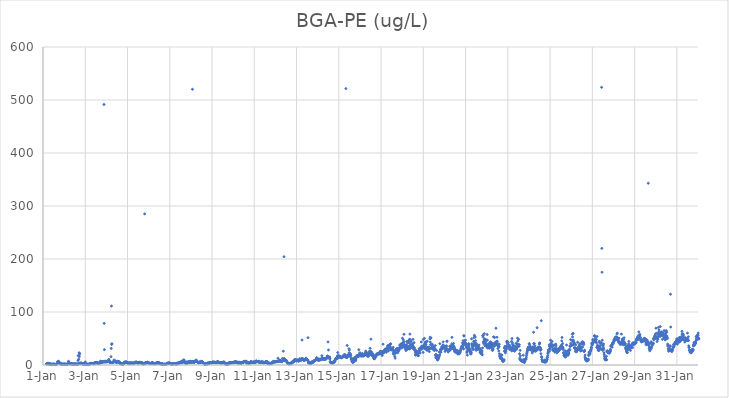
| Category | BGA-PE (ug/L) |
|---|---|
| 44562.166666666664 | 2.11 |
| 44562.177083333336 | 2.29 |
| 44562.1875 | 2.16 |
| 44562.197916666664 | 2.28 |
| 44562.208333333336 | 2.72 |
| 44562.21875 | 2.6 |
| 44562.229166666664 | 2.61 |
| 44562.239583333336 | 3.58 |
| 44562.25 | 2.67 |
| 44562.260416666664 | 2.59 |
| 44562.270833333336 | 2.35 |
| 44562.28125 | 1.76 |
| 44562.291666666664 | 1.93 |
| 44562.302083333336 | 1.72 |
| 44562.3125 | 1.82 |
| 44562.322916666664 | 1.83 |
| 44562.333333333336 | 1.77 |
| 44562.34375 | 2.21 |
| 44562.354166666664 | 1.28 |
| 44562.364583333336 | 1.04 |
| 44562.375 | 1.1 |
| 44562.385416666664 | 1.13 |
| 44562.395833333336 | 1.22 |
| 44562.40625 | 1.35 |
| 44562.416666666664 | 1.41 |
| 44562.427083333336 | 1.31 |
| 44562.4375 | 1.49 |
| 44562.447916666664 | 1.39 |
| 44562.458333333336 | 1.37 |
| 44562.46875 | 1.11 |
| 44562.479166666664 | 1.29 |
| 44562.489583333336 | 1.22 |
| 44562.5 | 1.03 |
| 44562.510416666664 | 1.6 |
| 44562.520833333336 | 1.67 |
| 44562.53125 | 1.59 |
| 44562.541666666664 | 1.43 |
| 44562.552083333336 | 1.12 |
| 44562.5625 | 1.05 |
| 44562.572916666664 | 0.8 |
| 44562.583333333336 | 1.04 |
| 44562.59375 | 0.9 |
| 44562.604166666664 | 0.95 |
| 44562.614583333336 | 0.87 |
| 44562.625 | 1.25 |
| 44562.635416666664 | 1.16 |
| 44562.645833333336 | 1.5 |
| 44562.65625 | 1.87 |
| 44562.666666666664 | 2.55 |
| 44562.677083333336 | 2.93 |
| 44562.6875 | 5.84 |
| 44562.697916666664 | 5.86 |
| 44562.708333333336 | 6.3 |
| 44562.71875 | 5.9 |
| 44562.729166666664 | 4.77 |
| 44562.739583333336 | 7.11 |
| 44562.75 | 4.66 |
| 44562.760416666664 | 4.44 |
| 44562.770833333336 | 3.27 |
| 44562.78125 | 4.49 |
| 44562.791666666664 | 3.69 |
| 44562.802083333336 | 3.65 |
| 44562.8125 | 2.8 |
| 44562.822916666664 | 2.25 |
| 44562.833333333336 | 2.29 |
| 44562.84375 | 2.47 |
| 44562.854166666664 | 2.15 |
| 44562.864583333336 | 2.07 |
| 44562.875 | 1.8 |
| 44562.885416666664 | 1.58 |
| 44562.895833333336 | 1.56 |
| 44562.90625 | 1.45 |
| 44562.916666666664 | 1.4 |
| 44562.927083333336 | 1.37 |
| 44562.9375 | 1.07 |
| 44562.947916666664 | 1.41 |
| 44562.958333333336 | 1.6 |
| 44562.96875 | 1.5 |
| 44562.979166666664 | 1.43 |
| 44562.989583333336 | 1.56 |
| 44563.0 | 1.49 |
| 44563.010416666664 | 1.58 |
| 44563.020833333336 | 1.63 |
| 44563.03125 | 2.08 |
| 44563.041666666664 | 1.45 |
| 44563.052083333336 | 1.15 |
| 44563.0625 | 1.32 |
| 44563.072916666664 | 1.17 |
| 44563.083333333336 | 1.31 |
| 44563.09375 | 1.29 |
| 44563.104166666664 | 1.23 |
| 44563.114583333336 | 1.16 |
| 44563.125 | 1.4 |
| 44563.135416666664 | 1.49 |
| 44563.145833333336 | 1.49 |
| 44563.15625 | 1.48 |
| 44563.166666666664 | 1.78 |
| 44563.177083333336 | 2.18 |
| 44563.1875 | 2.07 |
| 44563.197916666664 | 2.63 |
| 44563.208333333336 | 7.02 |
| 44563.21875 | 3.96 |
| 44563.229166666664 | 4.79 |
| 44563.239583333336 | 3.09 |
| 44563.25 | 2.77 |
| 44563.260416666664 | 2.47 |
| 44563.270833333336 | 2.76 |
| 44563.28125 | 2.58 |
| 44563.291666666664 | 2.22 |
| 44563.302083333336 | 2.59 |
| 44563.3125 | 2.33 |
| 44563.322916666664 | 2.36 |
| 44563.333333333336 | 2.18 |
| 44563.34375 | 2.45 |
| 44563.354166666664 | 1.99 |
| 44563.364583333336 | 1.74 |
| 44563.375 | 2.13 |
| 44563.385416666664 | 1.73 |
| 44563.395833333336 | 1.85 |
| 44563.40625 | 1.39 |
| 44563.416666666664 | 1.36 |
| 44563.427083333336 | 1.41 |
| 44563.4375 | 1.69 |
| 44563.447916666664 | 1.9 |
| 44563.458333333336 | 1.41 |
| 44563.46875 | 1.87 |
| 44563.479166666664 | 1.91 |
| 44563.489583333336 | 1.46 |
| 44563.5 | 1.68 |
| 44563.510416666664 | 1.66 |
| 44563.520833333336 | 1.47 |
| 44563.53125 | 1.86 |
| 44563.541666666664 | 1.67 |
| 44563.552083333336 | 1.77 |
| 44563.5625 | 1.71 |
| 44563.572916666664 | 1.68 |
| 44563.583333333336 | 1.6 |
| 44563.59375 | 1.88 |
| 44563.604166666664 | 1.62 |
| 44563.614583333336 | 1.55 |
| 44563.625 | 1.27 |
| 44563.635416666664 | 1.2 |
| 44563.645833333336 | 1.07 |
| 44563.65625 | 8.64 |
| 44563.666666666664 | 17.61 |
| 44563.677083333336 | 2.74 |
| 44563.6875 | 10.89 |
| 44563.697916666664 | 17.62 |
| 44563.708333333336 | 23.09 |
| 44563.71875 | 15.84 |
| 44563.729166666664 | 3.03 |
| 44563.739583333336 | 21.26 |
| 44563.75 | 3.67 |
| 44563.760416666664 | 3.06 |
| 44563.770833333336 | 2.98 |
| 44563.78125 | 3.27 |
| 44563.791666666664 | 2.96 |
| 44563.802083333336 | 2.76 |
| 44563.8125 | 3.29 |
| 44563.822916666664 | 3.71 |
| 44563.833333333336 | 3.31 |
| 44563.84375 | 2.88 |
| 44563.854166666664 | 2.68 |
| 44563.864583333336 | 2.38 |
| 44563.875 | 2.27 |
| 44563.885416666664 | 2.09 |
| 44563.895833333336 | 1.88 |
| 44563.90625 | 2.05 |
| 44563.916666666664 | 1.8 |
| 44563.927083333336 | 1.5 |
| 44563.9375 | 1.96 |
| 44563.947916666664 | 1.76 |
| 44563.958333333336 | 1.69 |
| 44563.96875 | 1.4 |
| 44563.979166666664 | 1.38 |
| 44563.989583333336 | 1.44 |
| 44564.0 | 5.81 |
| 44564.010416666664 | 1.47 |
| 44564.020833333336 | 1.43 |
| 44564.03125 | 1.42 |
| 44564.041666666664 | 1.51 |
| 44564.052083333336 | 1.83 |
| 44564.0625 | 2.11 |
| 44564.072916666664 | 1.36 |
| 44564.083333333336 | 1.62 |
| 44564.09375 | 1.32 |
| 44564.104166666664 | 1.28 |
| 44564.114583333336 | 1.21 |
| 44564.125 | 1.11 |
| 44564.135416666664 | 1.21 |
| 44564.145833333336 | 0.77 |
| 44564.15625 | 1.3 |
| 44564.166666666664 | 1.34 |
| 44564.177083333336 | 1.59 |
| 44564.1875 | 1.84 |
| 44564.197916666664 | 1.63 |
| 44564.208333333336 | 1.71 |
| 44564.21875 | 1.95 |
| 44564.229166666664 | 1.95 |
| 44564.239583333336 | 2.79 |
| 44564.25 | 2.95 |
| 44564.260416666664 | 3.01 |
| 44564.270833333336 | 3.1 |
| 44564.28125 | 2.88 |
| 44564.291666666664 | 2.84 |
| 44564.302083333336 | 2.92 |
| 44564.3125 | 2.6 |
| 44564.322916666664 | 2.63 |
| 44564.333333333336 | 2.81 |
| 44564.34375 | 2.92 |
| 44564.354166666664 | 2.99 |
| 44564.364583333336 | 2.77 |
| 44564.375 | 2.36 |
| 44564.385416666664 | 2.58 |
| 44564.395833333336 | 2.36 |
| 44564.40625 | 2.83 |
| 44564.416666666664 | 3.6 |
| 44564.427083333336 | 3.72 |
| 44564.4375 | 3.24 |
| 44564.447916666664 | 3.56 |
| 44564.458333333336 | 4.27 |
| 44564.46875 | 4.19 |
| 44564.479166666664 | 3.88 |
| 44564.489583333336 | 4.15 |
| 44564.5 | 4.04 |
| 44564.510416666664 | 3.62 |
| 44564.520833333336 | 4.27 |
| 44564.53125 | 4.92 |
| 44564.541666666664 | 4.33 |
| 44564.552083333336 | 4.77 |
| 44564.5625 | 4.04 |
| 44564.572916666664 | 4.05 |
| 44564.583333333336 | 3.89 |
| 44564.59375 | 3.47 |
| 44564.604166666664 | 3.73 |
| 44564.614583333336 | 3.18 |
| 44564.625 | 3.14 |
| 44564.635416666664 | 3.45 |
| 44564.645833333336 | 3.09 |
| 44564.65625 | 3.25 |
| 44564.666666666664 | 3.55 |
| 44564.677083333336 | 2.81 |
| 44564.6875 | 3.96 |
| 44564.697916666664 | 4.67 |
| 44564.708333333336 | 4.89 |
| 44564.71875 | 7.16 |
| 44564.729166666664 | 5.32 |
| 44564.739583333336 | 6.96 |
| 44564.75 | 5.05 |
| 44564.760416666664 | 5.24 |
| 44564.770833333336 | 5.33 |
| 44564.78125 | 5.11 |
| 44564.791666666664 | 5.12 |
| 44564.802083333336 | 4.48 |
| 44564.8125 | 5.64 |
| 44564.822916666664 | 5.12 |
| 44564.833333333336 | 6.38 |
| 44564.84375 | 6.57 |
| 44564.854166666664 | 6.22 |
| 44564.864583333336 | 6.23 |
| 44564.875 | 6.64 |
| 44564.885416666664 | 491.51 |
| 44564.895833333336 | 78.56 |
| 44564.90625 | 28.94 |
| 44564.916666666664 | 6.84 |
| 44564.927083333336 | 5.44 |
| 44564.9375 | 5.77 |
| 44564.947916666664 | 6.09 |
| 44564.958333333336 | 6.43 |
| 44564.96875 | 7.43 |
| 44564.979166666664 | 6.88 |
| 44564.989583333336 | 6.23 |
| 44565.0 | 6.31 |
| 44565.010416666664 | 6.39 |
| 44565.020833333336 | 6.7 |
| 44565.03125 | 6.05 |
| 44565.041666666664 | 6.24 |
| 44565.052083333336 | 6.72 |
| 44565.0625 | 6.73 |
| 44565.072916666664 | 6.51 |
| 44565.083333333336 | 7.16 |
| 44565.09375 | 7.15 |
| 44565.104166666664 | 8.91 |
| 44565.114583333336 | 10.65 |
| 44565.125 | 8.88 |
| 44565.135416666664 | 5.87 |
| 44565.145833333336 | 5.55 |
| 44565.15625 | 5.3 |
| 44565.166666666664 | 5.95 |
| 44565.177083333336 | 5.73 |
| 44565.1875 | 5.72 |
| 44565.197916666664 | 4.88 |
| 44565.208333333336 | 4.74 |
| 44565.21875 | 15.75 |
| 44565.229166666664 | 31.36 |
| 44565.239583333336 | 111.18 |
| 44565.25 | 38.77 |
| 44565.260416666664 | 40.15 |
| 44565.270833333336 | 4.97 |
| 44565.28125 | 5.16 |
| 44565.291666666664 | 4.92 |
| 44565.302083333336 | 4.88 |
| 44565.3125 | 5.42 |
| 44565.322916666664 | 5.68 |
| 44565.333333333336 | 6.02 |
| 44565.34375 | 5.96 |
| 44565.354166666664 | 5.97 |
| 44565.364583333336 | 9.51 |
| 44565.375 | 6.16 |
| 44565.385416666664 | 6.62 |
| 44565.395833333336 | 6.42 |
| 44565.40625 | 7.73 |
| 44565.416666666664 | 7.34 |
| 44565.427083333336 | 6.47 |
| 44565.4375 | 5.86 |
| 44565.447916666664 | 5.47 |
| 44565.458333333336 | 6.28 |
| 44565.46875 | 5.39 |
| 44565.479166666664 | 5.01 |
| 44565.489583333336 | 5.59 |
| 44565.5 | 4.86 |
| 44565.510416666664 | 5.76 |
| 44565.520833333336 | 5.95 |
| 44565.53125 | 6.95 |
| 44565.541666666664 | 7.04 |
| 44565.552083333336 | 6.57 |
| 44565.5625 | 6.72 |
| 44565.572916666664 | 6.26 |
| 44565.583333333336 | 5.77 |
| 44565.59375 | 5.93 |
| 44565.604166666664 | 6.02 |
| 44565.614583333336 | 5.01 |
| 44565.625 | 4.26 |
| 44565.635416666664 | 4.15 |
| 44565.645833333336 | 4.17 |
| 44565.65625 | 2.58 |
| 44565.666666666664 | 2.38 |
| 44565.677083333336 | 2.98 |
| 44565.6875 | 2.54 |
| 44565.697916666664 | 2.81 |
| 44565.708333333336 | 2.32 |
| 44565.71875 | 2.28 |
| 44565.729166666664 | 1.75 |
| 44565.739583333336 | 1.94 |
| 44565.75 | 1.74 |
| 44565.760416666664 | 1.83 |
| 44565.770833333336 | 1.88 |
| 44565.78125 | 2.08 |
| 44565.791666666664 | 1.95 |
| 44565.802083333336 | 1.94 |
| 44565.8125 | 2.76 |
| 44565.822916666664 | 2.54 |
| 44565.833333333336 | 3.47 |
| 44565.84375 | 4.47 |
| 44565.854166666664 | 4.86 |
| 44565.864583333336 | 5.23 |
| 44565.875 | 5.36 |
| 44565.885416666664 | 5.89 |
| 44565.895833333336 | 4.97 |
| 44565.90625 | 5.16 |
| 44565.916666666664 | 4.94 |
| 44565.927083333336 | 5.15 |
| 44565.9375 | 5.59 |
| 44565.947916666664 | 5.92 |
| 44565.958333333336 | 4.86 |
| 44565.96875 | 4.89 |
| 44565.979166666664 | 4.81 |
| 44565.989583333336 | 4.31 |
| 44566.0 | 3.94 |
| 44566.010416666664 | 3.83 |
| 44566.020833333336 | 3.91 |
| 44566.03125 | 3.57 |
| 44566.041666666664 | 3.56 |
| 44566.052083333336 | 3.29 |
| 44566.0625 | 3.26 |
| 44566.072916666664 | 3.29 |
| 44566.083333333336 | 3.52 |
| 44566.09375 | 3.62 |
| 44566.104166666664 | 3.82 |
| 44566.114583333336 | 3.82 |
| 44566.125 | 3.66 |
| 44566.135416666664 | 4.11 |
| 44566.145833333336 | 4.14 |
| 44566.15625 | 4.55 |
| 44566.166666666664 | 3.72 |
| 44566.177083333336 | 3.39 |
| 44566.1875 | 3.18 |
| 44566.197916666664 | 2.96 |
| 44566.208333333336 | 3.07 |
| 44566.21875 | 4.18 |
| 44566.229166666664 | 3.01 |
| 44566.239583333336 | 3.11 |
| 44566.25 | 2.92 |
| 44566.260416666664 | 2.66 |
| 44566.270833333336 | 2.74 |
| 44566.28125 | 2.9 |
| 44566.291666666664 | 3.3 |
| 44566.302083333336 | 4.05 |
| 44566.3125 | 4.14 |
| 44566.322916666664 | 3.85 |
| 44566.333333333336 | 4.39 |
| 44566.34375 | 4.23 |
| 44566.354166666664 | 4.23 |
| 44566.364583333336 | 4.4 |
| 44566.375 | 4.91 |
| 44566.385416666664 | 5.58 |
| 44566.395833333336 | 4.71 |
| 44566.40625 | 5.23 |
| 44566.416666666664 | 5.71 |
| 44566.427083333336 | 4.61 |
| 44566.4375 | 4.72 |
| 44566.447916666664 | 4.4 |
| 44566.458333333336 | 4.78 |
| 44566.46875 | 4.73 |
| 44566.479166666664 | 3.98 |
| 44566.489583333336 | 3.98 |
| 44566.5 | 4.04 |
| 44566.510416666664 | 3.81 |
| 44566.520833333336 | 3.92 |
| 44566.53125 | 3.81 |
| 44566.541666666664 | 3.99 |
| 44566.552083333336 | 4.38 |
| 44566.5625 | 4.97 |
| 44566.572916666664 | 4.76 |
| 44566.583333333336 | 4.6 |
| 44566.59375 | 5.1 |
| 44566.604166666664 | 4.72 |
| 44566.614583333336 | 4.89 |
| 44566.625 | 4.7 |
| 44566.635416666664 | 3.94 |
| 44566.645833333336 | 3.26 |
| 44566.65625 | 3.48 |
| 44566.666666666664 | 4.47 |
| 44566.677083333336 | 4.49 |
| 44566.6875 | 4.29 |
| 44566.697916666664 | 3.27 |
| 44566.708333333336 | 2.87 |
| 44566.71875 | 2.17 |
| 44566.729166666664 | 3.49 |
| 44566.739583333336 | 3.12 |
| 44566.75 | 2.86 |
| 44566.760416666664 | 2.6 |
| 44566.770833333336 | 1.72 |
| 44566.78125 | 2.61 |
| 44566.791666666664 | 2.53 |
| 44566.802083333336 | 2.63 |
| 44566.8125 | 285.13 |
| 44566.822916666664 | 3.67 |
| 44566.833333333336 | 3.15 |
| 44566.84375 | 4.15 |
| 44566.854166666664 | 4.37 |
| 44566.864583333336 | 4.66 |
| 44566.875 | 4.27 |
| 44566.885416666664 | 4.46 |
| 44566.895833333336 | 4.27 |
| 44566.90625 | 4.06 |
| 44566.916666666664 | 4.03 |
| 44566.927083333336 | 5.26 |
| 44566.9375 | 4.32 |
| 44566.947916666664 | 5.22 |
| 44566.958333333336 | 4.73 |
| 44566.96875 | 4.41 |
| 44566.979166666664 | 4.07 |
| 44566.989583333336 | 4.1 |
| 44567.0 | 3.97 |
| 44567.010416666664 | 3.7 |
| 44567.020833333336 | 3.49 |
| 44567.03125 | 3.88 |
| 44567.041666666664 | 3.08 |
| 44567.052083333336 | 2.7 |
| 44567.0625 | 3.13 |
| 44567.072916666664 | 2.64 |
| 44567.083333333336 | 2.91 |
| 44567.09375 | 2.89 |
| 44567.104166666664 | 2.64 |
| 44567.114583333336 | 3.33 |
| 44567.125 | 3.05 |
| 44567.135416666664 | 2.96 |
| 44567.145833333336 | 3.44 |
| 44567.15625 | 3.65 |
| 44567.166666666664 | 4.77 |
| 44567.177083333336 | 4.05 |
| 44567.1875 | 3.9 |
| 44567.197916666664 | 4.57 |
| 44567.208333333336 | 2.63 |
| 44567.21875 | 2.44 |
| 44567.229166666664 | 2.6 |
| 44567.239583333336 | 2.7 |
| 44567.25 | 2.59 |
| 44567.260416666664 | 2.6 |
| 44567.270833333336 | 2.74 |
| 44567.28125 | 2.3 |
| 44567.291666666664 | 2.28 |
| 44567.302083333336 | 2.63 |
| 44567.3125 | 2.71 |
| 44567.322916666664 | 3.09 |
| 44567.333333333336 | 2.79 |
| 44567.34375 | 3.35 |
| 44567.354166666664 | 3.4 |
| 44567.364583333336 | 3.49 |
| 44567.375 | 3.71 |
| 44567.385416666664 | 3.47 |
| 44567.395833333336 | 3.89 |
| 44567.40625 | 4.15 |
| 44567.416666666664 | 3.67 |
| 44567.427083333336 | 4.73 |
| 44567.4375 | 4.31 |
| 44567.447916666664 | 4.08 |
| 44567.458333333336 | 3.75 |
| 44567.46875 | 3.77 |
| 44567.479166666664 | 3.75 |
| 44567.489583333336 | 3.4 |
| 44567.5 | 3.94 |
| 44567.510416666664 | 3.69 |
| 44567.520833333336 | 3.34 |
| 44567.53125 | 3.56 |
| 44567.541666666664 | 3.08 |
| 44567.552083333336 | 2.54 |
| 44567.5625 | 2.37 |
| 44567.572916666664 | 2.17 |
| 44567.583333333336 | 2.22 |
| 44567.59375 | 2.31 |
| 44567.604166666664 | 1.94 |
| 44567.614583333336 | 2.05 |
| 44567.625 | 2.56 |
| 44567.635416666664 | 2.59 |
| 44567.645833333336 | 2.04 |
| 44567.65625 | 1.23 |
| 44567.666666666664 | 0.93 |
| 44567.677083333336 | 1.3 |
| 44567.6875 | 1.24 |
| 44567.697916666664 | 1.38 |
| 44567.708333333336 | 1.08 |
| 44567.71875 | 1.06 |
| 44567.729166666664 | 1.39 |
| 44567.739583333336 | 0.95 |
| 44567.75 | 1.34 |
| 44567.760416666664 | 1.46 |
| 44567.770833333336 | 1.47 |
| 44567.78125 | 1.3 |
| 44567.791666666664 | 1.26 |
| 44567.802083333336 | 0.83 |
| 44567.8125 | 1.22 |
| 44567.822916666664 | 1.59 |
| 44567.833333333336 | 1.16 |
| 44567.84375 | 1.82 |
| 44567.854166666664 | 1.87 |
| 44567.864583333336 | 2.66 |
| 44567.875 | 3.16 |
| 44567.885416666664 | 3.35 |
| 44567.895833333336 | 2.85 |
| 44567.90625 | 3.34 |
| 44567.916666666664 | 2.97 |
| 44567.927083333336 | 2.87 |
| 44567.9375 | 3.24 |
| 44567.947916666664 | 4.06 |
| 44567.958333333336 | 3.34 |
| 44567.96875 | 3.55 |
| 44567.979166666664 | 3.32 |
| 44567.989583333336 | 3.7 |
| 44568.0 | 3.38 |
| 44568.010416666664 | 3.17 |
| 44568.020833333336 | 2.76 |
| 44568.03125 | 2.54 |
| 44568.041666666664 | 2.44 |
| 44568.052083333336 | 2.34 |
| 44568.0625 | 2.07 |
| 44568.072916666664 | 2.01 |
| 44568.083333333336 | 1.94 |
| 44568.09375 | 1.86 |
| 44568.104166666664 | 1.66 |
| 44568.114583333336 | 1.73 |
| 44568.125 | 2.08 |
| 44568.135416666664 | 1.95 |
| 44568.145833333336 | 2.07 |
| 44568.15625 | 2.33 |
| 44568.166666666664 | 2.37 |
| 44568.177083333336 | 2.48 |
| 44568.1875 | 2.61 |
| 44568.197916666664 | 2.5 |
| 44568.208333333336 | 2.61 |
| 44568.21875 | 2.54 |
| 44568.229166666664 | 2.72 |
| 44568.239583333336 | 2.74 |
| 44568.25 | 2.73 |
| 44568.260416666664 | 2.42 |
| 44568.270833333336 | 2.04 |
| 44568.28125 | 2.35 |
| 44568.291666666664 | 2.21 |
| 44568.302083333336 | 1.8 |
| 44568.3125 | 1.73 |
| 44568.322916666664 | 1.62 |
| 44568.333333333336 | 1.86 |
| 44568.34375 | 3.98 |
| 44568.354166666664 | 2.4 |
| 44568.364583333336 | 3.06 |
| 44568.375 | 2.83 |
| 44568.385416666664 | 2.56 |
| 44568.395833333336 | 2.79 |
| 44568.40625 | 3.2 |
| 44568.416666666664 | 3.42 |
| 44568.427083333336 | 3.83 |
| 44568.4375 | 4.24 |
| 44568.447916666664 | 4.28 |
| 44568.458333333336 | 4.46 |
| 44568.46875 | 4.06 |
| 44568.479166666664 | 4.56 |
| 44568.489583333336 | 4.97 |
| 44568.5 | 5.08 |
| 44568.510416666664 | 5.72 |
| 44568.520833333336 | 4.78 |
| 44568.53125 | 4.13 |
| 44568.541666666664 | 4.49 |
| 44568.552083333336 | 4.26 |
| 44568.5625 | 4.56 |
| 44568.572916666664 | 6.53 |
| 44568.583333333336 | 7.46 |
| 44568.59375 | 5.61 |
| 44568.604166666664 | 5.05 |
| 44568.614583333336 | 5.66 |
| 44568.625 | 6.56 |
| 44568.635416666664 | 8.59 |
| 44568.645833333336 | 6.92 |
| 44568.65625 | 8.84 |
| 44568.666666666664 | 9.38 |
| 44568.677083333336 | 9.16 |
| 44568.6875 | 6.43 |
| 44568.697916666664 | 4.34 |
| 44568.708333333336 | 5.94 |
| 44568.71875 | 4.82 |
| 44568.729166666664 | 4 |
| 44568.739583333336 | 4.93 |
| 44568.75 | 3.76 |
| 44568.760416666664 | 3.91 |
| 44568.770833333336 | 3.83 |
| 44568.78125 | 4.05 |
| 44568.791666666664 | 3.72 |
| 44568.802083333336 | 5.92 |
| 44568.8125 | 3.46 |
| 44568.822916666664 | 3.85 |
| 44568.833333333336 | 4.15 |
| 44568.84375 | 4.53 |
| 44568.854166666664 | 5.79 |
| 44568.864583333336 | 5.27 |
| 44568.875 | 5.13 |
| 44568.885416666664 | 6.02 |
| 44568.895833333336 | 6.25 |
| 44568.90625 | 5.95 |
| 44568.916666666664 | 5.91 |
| 44568.927083333336 | 5.65 |
| 44568.9375 | 5.1 |
| 44568.947916666664 | 5.64 |
| 44568.958333333336 | 5.31 |
| 44568.96875 | 6.94 |
| 44568.979166666664 | 6.93 |
| 44568.989583333336 | 6.15 |
| 44569.0 | 4.92 |
| 44569.010416666664 | 5.11 |
| 44569.020833333336 | 5.33 |
| 44569.03125 | 6.2 |
| 44569.041666666664 | 6.01 |
| 44569.052083333336 | 5.34 |
| 44569.0625 | 5.39 |
| 44569.072916666664 | 520.16 |
| 44569.083333333336 | 5.53 |
| 44569.09375 | 6.6 |
| 44569.104166666664 | 7.11 |
| 44569.114583333336 | 6.39 |
| 44569.125 | 5.35 |
| 44569.135416666664 | 5.47 |
| 44569.145833333336 | 4.86 |
| 44569.15625 | 5.23 |
| 44569.166666666664 | 5.05 |
| 44569.177083333336 | 5.96 |
| 44569.1875 | 6.86 |
| 44569.197916666664 | 7.11 |
| 44569.208333333336 | 7.59 |
| 44569.21875 | 7.54 |
| 44569.229166666664 | 7.86 |
| 44569.239583333336 | 9.14 |
| 44569.25 | 9.19 |
| 44569.260416666664 | 7.88 |
| 44569.270833333336 | 7.63 |
| 44569.28125 | 6.55 |
| 44569.291666666664 | 6.66 |
| 44569.302083333336 | 5.87 |
| 44569.3125 | 5.71 |
| 44569.322916666664 | 5.92 |
| 44569.333333333336 | 5.32 |
| 44569.34375 | 4.57 |
| 44569.354166666664 | 4.35 |
| 44569.364583333336 | 4.29 |
| 44569.375 | 4.55 |
| 44569.385416666664 | 5 |
| 44569.395833333336 | 5.51 |
| 44569.40625 | 5.3 |
| 44569.416666666664 | 5.48 |
| 44569.427083333336 | 5.35 |
| 44569.4375 | 5.17 |
| 44569.447916666664 | 5.23 |
| 44569.458333333336 | 5.29 |
| 44569.46875 | 5.3 |
| 44569.479166666664 | 5.01 |
| 44569.489583333336 | 5.8 |
| 44569.5 | 7.14 |
| 44569.510416666664 | 6.32 |
| 44569.520833333336 | 6.45 |
| 44569.53125 | 6.31 |
| 44569.541666666664 | 5.9 |
| 44569.552083333336 | 5.45 |
| 44569.5625 | 4.92 |
| 44569.572916666664 | 4.32 |
| 44569.583333333336 | 3.85 |
| 44569.59375 | 4.01 |
| 44569.604166666664 | 3.67 |
| 44569.614583333336 | 2.8 |
| 44569.625 | 2.29 |
| 44569.635416666664 | 2.33 |
| 44569.645833333336 | 1.68 |
| 44569.65625 | 1.97 |
| 44569.666666666664 | 1.43 |
| 44569.677083333336 | 1.79 |
| 44569.6875 | 1.48 |
| 44569.697916666664 | 1.85 |
| 44569.708333333336 | 1.77 |
| 44569.71875 | 2.48 |
| 44569.729166666664 | 1.88 |
| 44569.739583333336 | 1.97 |
| 44569.75 | 2.69 |
| 44569.760416666664 | 2.81 |
| 44569.770833333336 | 3.61 |
| 44569.78125 | 3.16 |
| 44569.791666666664 | 2.08 |
| 44569.802083333336 | 2.22 |
| 44569.8125 | 3.91 |
| 44569.822916666664 | 3.34 |
| 44569.833333333336 | 3.52 |
| 44569.84375 | 3.34 |
| 44569.854166666664 | 2.34 |
| 44569.864583333336 | 2.53 |
| 44569.875 | 4.1 |
| 44569.885416666664 | 4.23 |
| 44569.895833333336 | 5 |
| 44569.90625 | 4.49 |
| 44569.916666666664 | 4.51 |
| 44569.927083333336 | 4.61 |
| 44569.9375 | 4.5 |
| 44569.947916666664 | 4.69 |
| 44569.958333333336 | 4.42 |
| 44569.96875 | 4.39 |
| 44569.979166666664 | 4.11 |
| 44569.989583333336 | 4.38 |
| 44570.0 | 4.67 |
| 44570.010416666664 | 4.54 |
| 44570.020833333336 | 4.77 |
| 44570.03125 | 6.03 |
| 44570.041666666664 | 4.93 |
| 44570.052083333336 | 5.37 |
| 44570.0625 | 4.96 |
| 44570.072916666664 | 4.8 |
| 44570.083333333336 | 5.1 |
| 44570.09375 | 5.2 |
| 44570.104166666664 | 5.06 |
| 44570.114583333336 | 5.16 |
| 44570.125 | 5.02 |
| 44570.135416666664 | 4.79 |
| 44570.145833333336 | 5.18 |
| 44570.15625 | 4.65 |
| 44570.166666666664 | 4.32 |
| 44570.177083333336 | 4.82 |
| 44570.1875 | 4.37 |
| 44570.197916666664 | 4.32 |
| 44570.208333333336 | 4.57 |
| 44570.21875 | 4.85 |
| 44570.229166666664 | 5.07 |
| 44570.239583333336 | 5.33 |
| 44570.25 | 6.43 |
| 44570.260416666664 | 6.18 |
| 44570.270833333336 | 6.28 |
| 44570.28125 | 5.62 |
| 44570.291666666664 | 5.14 |
| 44570.302083333336 | 5.75 |
| 44570.3125 | 5.16 |
| 44570.322916666664 | 4.73 |
| 44570.333333333336 | 4.45 |
| 44570.34375 | 4.62 |
| 44570.354166666664 | 4.77 |
| 44570.364583333336 | 4.56 |
| 44570.375 | 3.84 |
| 44570.385416666664 | 4.02 |
| 44570.395833333336 | 4.15 |
| 44570.40625 | 4.31 |
| 44570.416666666664 | 4.38 |
| 44570.427083333336 | 4.17 |
| 44570.4375 | 4.23 |
| 44570.447916666664 | 4.17 |
| 44570.458333333336 | 4.31 |
| 44570.46875 | 4.03 |
| 44570.479166666664 | 3.86 |
| 44570.489583333336 | 4.36 |
| 44570.5 | 4.25 |
| 44570.510416666664 | 4.89 |
| 44570.520833333336 | 5.46 |
| 44570.53125 | 4.92 |
| 44570.541666666664 | 4.9 |
| 44570.552083333336 | 5.49 |
| 44570.5625 | 5.16 |
| 44570.572916666664 | 5.6 |
| 44570.583333333336 | 4.73 |
| 44570.59375 | 3.31 |
| 44570.604166666664 | 3.48 |
| 44570.614583333336 | 2.04 |
| 44570.625 | 1.99 |
| 44570.635416666664 | 2.45 |
| 44570.645833333336 | 2.12 |
| 44570.65625 | 1.73 |
| 44570.666666666664 | 2.14 |
| 44570.677083333336 | 2.21 |
| 44570.6875 | 2.2 |
| 44570.697916666664 | 1.8 |
| 44570.708333333336 | 2 |
| 44570.71875 | 1.74 |
| 44570.729166666664 | 1.82 |
| 44570.739583333336 | 2.13 |
| 44570.75 | 1.73 |
| 44570.760416666664 | 1.78 |
| 44570.770833333336 | 1.87 |
| 44570.78125 | 2.85 |
| 44570.791666666664 | 3.82 |
| 44570.802083333336 | 4.37 |
| 44570.8125 | 3.69 |
| 44570.822916666664 | 3.81 |
| 44570.833333333336 | 3.72 |
| 44570.84375 | 3.55 |
| 44570.854166666664 | 4 |
| 44570.864583333336 | 4.17 |
| 44570.875 | 4.09 |
| 44570.885416666664 | 4.31 |
| 44570.895833333336 | 4.19 |
| 44570.90625 | 4.31 |
| 44570.916666666664 | 4.37 |
| 44570.927083333336 | 4.48 |
| 44570.9375 | 4.43 |
| 44570.947916666664 | 4.52 |
| 44570.958333333336 | 4.54 |
| 44570.96875 | 4.54 |
| 44570.979166666664 | 4.73 |
| 44570.989583333336 | 4.87 |
| 44571.0 | 4.44 |
| 44571.010416666664 | 4.52 |
| 44571.020833333336 | 4.85 |
| 44571.03125 | 4.95 |
| 44571.041666666664 | 5.93 |
| 44571.052083333336 | 5 |
| 44571.0625 | 5.44 |
| 44571.072916666664 | 5.41 |
| 44571.083333333336 | 5.29 |
| 44571.09375 | 5.25 |
| 44571.104166666664 | 5.72 |
| 44571.114583333336 | 5.35 |
| 44571.125 | 6.07 |
| 44571.135416666664 | 5.23 |
| 44571.145833333336 | 5.14 |
| 44571.15625 | 5.65 |
| 44571.166666666664 | 5.4 |
| 44571.177083333336 | 5.49 |
| 44571.1875 | 5.03 |
| 44571.197916666664 | 5.15 |
| 44571.208333333336 | 4.45 |
| 44571.21875 | 3.95 |
| 44571.229166666664 | 4 |
| 44571.239583333336 | 3.8 |
| 44571.25 | 5.05 |
| 44571.260416666664 | 3.9 |
| 44571.270833333336 | 4.18 |
| 44571.28125 | 4.8 |
| 44571.291666666664 | 4.38 |
| 44571.302083333336 | 5.11 |
| 44571.3125 | 3.84 |
| 44571.322916666664 | 3.85 |
| 44571.333333333336 | 4.16 |
| 44571.34375 | 3.83 |
| 44571.354166666664 | 3.88 |
| 44571.364583333336 | 3.62 |
| 44571.375 | 3.85 |
| 44571.385416666664 | 3.62 |
| 44571.395833333336 | 3.66 |
| 44571.40625 | 3.87 |
| 44571.416666666664 | 4.57 |
| 44571.427083333336 | 4.96 |
| 44571.4375 | 4.6 |
| 44571.447916666664 | 4.74 |
| 44571.458333333336 | 5.05 |
| 44571.46875 | 5.53 |
| 44571.479166666664 | 5.25 |
| 44571.489583333336 | 5.57 |
| 44571.5 | 5.76 |
| 44571.510416666664 | 6.64 |
| 44571.520833333336 | 6.69 |
| 44571.53125 | 6.11 |
| 44571.541666666664 | 6.44 |
| 44571.552083333336 | 7.12 |
| 44571.5625 | 6.51 |
| 44571.572916666664 | 5.82 |
| 44571.583333333336 | 5.91 |
| 44571.59375 | 6.29 |
| 44571.604166666664 | 6.15 |
| 44571.614583333336 | 6.24 |
| 44571.625 | 7.09 |
| 44571.635416666664 | 4.31 |
| 44571.645833333336 | 4.07 |
| 44571.65625 | 3.7 |
| 44571.666666666664 | 4.69 |
| 44571.677083333336 | 4.83 |
| 44571.6875 | 4.28 |
| 44571.697916666664 | 4.76 |
| 44571.708333333336 | 4.42 |
| 44571.71875 | 4.77 |
| 44571.729166666664 | 3.34 |
| 44571.739583333336 | 3.08 |
| 44571.75 | 3.04 |
| 44571.760416666664 | 3.17 |
| 44571.770833333336 | 3.91 |
| 44571.78125 | 3.3 |
| 44571.791666666664 | 3.58 |
| 44571.802083333336 | 4.97 |
| 44571.8125 | 5.02 |
| 44571.822916666664 | 5.55 |
| 44571.833333333336 | 5.81 |
| 44571.84375 | 6.54 |
| 44571.854166666664 | 6.22 |
| 44571.864583333336 | 5.65 |
| 44571.875 | 5.68 |
| 44571.885416666664 | 5.38 |
| 44571.895833333336 | 5.11 |
| 44571.90625 | 4.97 |
| 44571.916666666664 | 4.74 |
| 44571.927083333336 | 4.86 |
| 44571.9375 | 4.9 |
| 44571.947916666664 | 5.17 |
| 44571.958333333336 | 5.54 |
| 44571.96875 | 5.49 |
| 44571.979166666664 | 5.6 |
| 44571.989583333336 | 5.25 |
| 44572.0 | 5.42 |
| 44572.010416666664 | 5.32 |
| 44572.020833333336 | 5.26 |
| 44572.03125 | 5.52 |
| 44572.041666666664 | 5.45 |
| 44572.052083333336 | 5.41 |
| 44572.0625 | 5.62 |
| 44572.072916666664 | 5.21 |
| 44572.083333333336 | 6.35 |
| 44572.09375 | 7.99 |
| 44572.104166666664 | 6.03 |
| 44572.114583333336 | 6.72 |
| 44572.125 | 6.35 |
| 44572.135416666664 | 6.42 |
| 44572.145833333336 | 6.51 |
| 44572.15625 | 6.51 |
| 44572.166666666664 | 6.49 |
| 44572.177083333336 | 6.23 |
| 44572.1875 | 7.07 |
| 44572.197916666664 | 5.79 |
| 44572.208333333336 | 6.19 |
| 44572.21875 | 6.89 |
| 44572.229166666664 | 6.65 |
| 44572.239583333336 | 5.04 |
| 44572.25 | 4.74 |
| 44572.260416666664 | 4.66 |
| 44572.270833333336 | 5.13 |
| 44572.28125 | 4.85 |
| 44572.291666666664 | 5.09 |
| 44572.302083333336 | 5.47 |
| 44572.3125 | 4.28 |
| 44572.322916666664 | 4.7 |
| 44572.333333333336 | 5.79 |
| 44572.34375 | 5.79 |
| 44572.354166666664 | 5.79 |
| 44572.364583333336 | 5.45 |
| 44572.375 | 5.47 |
| 44572.385416666664 | 5.51 |
| 44572.395833333336 | 5.57 |
| 44572.40625 | 4.96 |
| 44572.416666666664 | 4.74 |
| 44572.427083333336 | 5.57 |
| 44572.4375 | 3.98 |
| 44572.447916666664 | 4.27 |
| 44572.458333333336 | 4.77 |
| 44572.46875 | 4.56 |
| 44572.479166666664 | 4.16 |
| 44572.489583333336 | 4.65 |
| 44572.5 | 4.5 |
| 44572.510416666664 | 5.22 |
| 44572.520833333336 | 5.56 |
| 44572.53125 | 6.04 |
| 44572.541666666664 | 6.32 |
| 44572.552083333336 | 5.95 |
| 44572.5625 | 6.01 |
| 44572.572916666664 | 6.27 |
| 44572.583333333336 | 6.74 |
| 44572.59375 | 5.94 |
| 44572.604166666664 | 6.57 |
| 44572.614583333336 | 3.97 |
| 44572.625 | 2.83 |
| 44572.635416666664 | 3.57 |
| 44572.645833333336 | 3.56 |
| 44572.65625 | 3.05 |
| 44572.666666666664 | 3.65 |
| 44572.677083333336 | 3.16 |
| 44572.6875 | 2.89 |
| 44572.697916666664 | 4.17 |
| 44572.708333333336 | 2.83 |
| 44572.71875 | 2.15 |
| 44572.729166666664 | 2.26 |
| 44572.739583333336 | 2.16 |
| 44572.75 | 3.13 |
| 44572.760416666664 | 2.57 |
| 44572.770833333336 | 2.88 |
| 44572.78125 | 3.05 |
| 44572.791666666664 | 2.73 |
| 44572.802083333336 | 2.65 |
| 44572.8125 | 2.61 |
| 44572.822916666664 | 3.05 |
| 44572.833333333336 | 3.5 |
| 44572.84375 | 4.28 |
| 44572.854166666664 | 4.66 |
| 44572.864583333336 | 4.58 |
| 44572.875 | 5.28 |
| 44572.885416666664 | 5.97 |
| 44572.895833333336 | 5.95 |
| 44572.90625 | 5.74 |
| 44572.916666666664 | 7.04 |
| 44572.927083333336 | 6.29 |
| 44572.9375 | 6.55 |
| 44572.947916666664 | 5.37 |
| 44572.958333333336 | 5.62 |
| 44572.96875 | 6.25 |
| 44572.979166666664 | 6.08 |
| 44572.989583333336 | 5.94 |
| 44573.0 | 6.03 |
| 44573.010416666664 | 6.37 |
| 44573.020833333336 | 6.44 |
| 44573.03125 | 6.84 |
| 44573.041666666664 | 6.58 |
| 44573.052083333336 | 6.4 |
| 44573.0625 | 6.46 |
| 44573.072916666664 | 6.38 |
| 44573.083333333336 | 6.4 |
| 44573.09375 | 6.33 |
| 44573.104166666664 | 6.68 |
| 44573.114583333336 | 6.89 |
| 44573.125 | 12.66 |
| 44573.135416666664 | 7.67 |
| 44573.145833333336 | 7.28 |
| 44573.15625 | 6.54 |
| 44573.166666666664 | 7.69 |
| 44573.177083333336 | 9.01 |
| 44573.1875 | 7.71 |
| 44573.197916666664 | 7.83 |
| 44573.208333333336 | 7.67 |
| 44573.21875 | 7.48 |
| 44573.229166666664 | 8.34 |
| 44573.239583333336 | 8.75 |
| 44573.25 | 7.29 |
| 44573.260416666664 | 6.92 |
| 44573.270833333336 | 7.07 |
| 44573.28125 | 6.69 |
| 44573.291666666664 | 6.74 |
| 44573.302083333336 | 6.57 |
| 44573.3125 | 6.11 |
| 44573.322916666664 | 7.75 |
| 44573.333333333336 | 12.32 |
| 44573.34375 | 8.26 |
| 44573.354166666664 | 8.36 |
| 44573.364583333336 | 8.98 |
| 44573.375 | 26.01 |
| 44573.385416666664 | 9.57 |
| 44573.395833333336 | 10.68 |
| 44573.40625 | 204.33 |
| 44573.416666666664 | 12.32 |
| 44573.427083333336 | 9.48 |
| 44573.4375 | 11.25 |
| 44573.447916666664 | 9.27 |
| 44573.458333333336 | 7.81 |
| 44573.46875 | 8.11 |
| 44573.479166666664 | 7.96 |
| 44573.489583333336 | 8.5 |
| 44573.5 | 8.42 |
| 44573.510416666664 | 8.74 |
| 44573.520833333336 | 7.24 |
| 44573.53125 | 7.83 |
| 44573.541666666664 | 6.29 |
| 44573.552083333336 | 5.6 |
| 44573.5625 | 3.82 |
| 44573.572916666664 | 3.48 |
| 44573.583333333336 | 3.15 |
| 44573.59375 | 3.14 |
| 44573.604166666664 | 2.82 |
| 44573.614583333336 | 2.42 |
| 44573.625 | 2.59 |
| 44573.635416666664 | 2.29 |
| 44573.645833333336 | 2.63 |
| 44573.65625 | 2.6 |
| 44573.666666666664 | 2.4 |
| 44573.677083333336 | 2.16 |
| 44573.6875 | 2.32 |
| 44573.697916666664 | 2.65 |
| 44573.708333333336 | 2.4 |
| 44573.71875 | 2.56 |
| 44573.729166666664 | 3.25 |
| 44573.739583333336 | 3.1 |
| 44573.75 | 3.03 |
| 44573.760416666664 | 3.65 |
| 44573.770833333336 | 5.36 |
| 44573.78125 | 4.31 |
| 44573.791666666664 | 4.25 |
| 44573.802083333336 | 5.2 |
| 44573.8125 | 4.57 |
| 44573.822916666664 | 5.4 |
| 44573.833333333336 | 5.62 |
| 44573.84375 | 6.98 |
| 44573.854166666664 | 7.77 |
| 44573.864583333336 | 8.33 |
| 44573.875 | 8.11 |
| 44573.885416666664 | 6.32 |
| 44573.895833333336 | 8.07 |
| 44573.90625 | 8.32 |
| 44573.916666666664 | 9.55 |
| 44573.927083333336 | 10.8 |
| 44573.9375 | 9.5 |
| 44573.947916666664 | 9.05 |
| 44573.958333333336 | 8.98 |
| 44573.96875 | 8.47 |
| 44573.979166666664 | 8.37 |
| 44573.989583333336 | 7.51 |
| 44574.0 | 9.26 |
| 44574.010416666664 | 9.46 |
| 44574.020833333336 | 8.72 |
| 44574.03125 | 9.22 |
| 44574.041666666664 | 9.36 |
| 44574.052083333336 | 8.13 |
| 44574.0625 | 8.23 |
| 44574.072916666664 | 7.87 |
| 44574.083333333336 | 7.95 |
| 44574.09375 | 7.52 |
| 44574.104166666664 | 7.86 |
| 44574.114583333336 | 7.89 |
| 44574.125 | 7.99 |
| 44574.135416666664 | 8.74 |
| 44574.145833333336 | 11.12 |
| 44574.15625 | 11.87 |
| 44574.166666666664 | 10.36 |
| 44574.177083333336 | 9.31 |
| 44574.1875 | 9.14 |
| 44574.197916666664 | 9.95 |
| 44574.208333333336 | 9.78 |
| 44574.21875 | 8.96 |
| 44574.229166666664 | 10.07 |
| 44574.239583333336 | 10.04 |
| 44574.25 | 12.47 |
| 44574.260416666664 | 47.09 |
| 44574.270833333336 | 10.61 |
| 44574.28125 | 10.21 |
| 44574.291666666664 | 10.97 |
| 44574.302083333336 | 11.93 |
| 44574.3125 | 9.92 |
| 44574.322916666664 | 9.23 |
| 44574.333333333336 | 9.69 |
| 44574.34375 | 9.5 |
| 44574.354166666664 | 8.65 |
| 44574.364583333336 | 9.26 |
| 44574.375 | 9.18 |
| 44574.385416666664 | 8.82 |
| 44574.395833333336 | 9.83 |
| 44574.40625 | 10.49 |
| 44574.416666666664 | 10.09 |
| 44574.427083333336 | 11.61 |
| 44574.4375 | 11.32 |
| 44574.447916666664 | 13.05 |
| 44574.458333333336 | 10.76 |
| 44574.46875 | 11.67 |
| 44574.479166666664 | 9.98 |
| 44574.489583333336 | 10.72 |
| 44574.5 | 9.83 |
| 44574.510416666664 | 9.88 |
| 44574.520833333336 | 9.66 |
| 44574.53125 | 9.26 |
| 44574.541666666664 | 51.45 |
| 44574.552083333336 | 5.85 |
| 44574.5625 | 3.97 |
| 44574.572916666664 | 3.99 |
| 44574.583333333336 | 4.67 |
| 44574.59375 | 5.45 |
| 44574.604166666664 | 4.85 |
| 44574.614583333336 | 5.08 |
| 44574.625 | 3.69 |
| 44574.635416666664 | 3.69 |
| 44574.645833333336 | 2.85 |
| 44574.65625 | 2.59 |
| 44574.666666666664 | 3.81 |
| 44574.677083333336 | 2.65 |
| 44574.6875 | 3.63 |
| 44574.697916666664 | 5.74 |
| 44574.708333333336 | 4.62 |
| 44574.71875 | 4.2 |
| 44574.729166666664 | 5.11 |
| 44574.739583333336 | 6.09 |
| 44574.75 | 4.72 |
| 44574.760416666664 | 5.73 |
| 44574.770833333336 | 4.82 |
| 44574.78125 | 4.94 |
| 44574.791666666664 | 6.04 |
| 44574.802083333336 | 7.45 |
| 44574.8125 | 6.39 |
| 44574.822916666664 | 7.6 |
| 44574.833333333336 | 8.07 |
| 44574.84375 | 7.89 |
| 44574.854166666664 | 8.25 |
| 44574.864583333336 | 8.93 |
| 44574.875 | 8.23 |
| 44574.885416666664 | 9.11 |
| 44574.895833333336 | 9.66 |
| 44574.90625 | 9.43 |
| 44574.916666666664 | 9.69 |
| 44574.927083333336 | 9.85 |
| 44574.9375 | 11.15 |
| 44574.947916666664 | 13.27 |
| 44574.958333333336 | 13.58 |
| 44574.96875 | 12.64 |
| 44574.979166666664 | 10.93 |
| 44574.989583333336 | 10.61 |
| 44575.0 | 9.28 |
| 44575.010416666664 | 10.07 |
| 44575.020833333336 | 9.81 |
| 44575.03125 | 10.66 |
| 44575.041666666664 | 8.75 |
| 44575.052083333336 | 9.54 |
| 44575.0625 | 11.45 |
| 44575.072916666664 | 8.86 |
| 44575.083333333336 | 10.43 |
| 44575.09375 | 9.92 |
| 44575.104166666664 | 10.55 |
| 44575.114583333336 | 10.16 |
| 44575.125 | 9.82 |
| 44575.135416666664 | 10.54 |
| 44575.145833333336 | 10.37 |
| 44575.15625 | 10.86 |
| 44575.166666666664 | 10.53 |
| 44575.177083333336 | 10.67 |
| 44575.1875 | 11.91 |
| 44575.197916666664 | 17.59 |
| 44575.208333333336 | 13.83 |
| 44575.21875 | 13.09 |
| 44575.229166666664 | 11.9 |
| 44575.239583333336 | 11.13 |
| 44575.25 | 13.05 |
| 44575.260416666664 | 10.52 |
| 44575.270833333336 | 12.06 |
| 44575.28125 | 11.62 |
| 44575.291666666664 | 12.34 |
| 44575.302083333336 | 12.34 |
| 44575.3125 | 11.18 |
| 44575.322916666664 | 11.45 |
| 44575.333333333336 | 10.82 |
| 44575.34375 | 10.85 |
| 44575.354166666664 | 10.84 |
| 44575.364583333336 | 11.1 |
| 44575.375 | 11.66 |
| 44575.385416666664 | 12.06 |
| 44575.395833333336 | 11.4 |
| 44575.40625 | 12.08 |
| 44575.416666666664 | 12.78 |
| 44575.427083333336 | 13.2 |
| 44575.4375 | 13.81 |
| 44575.447916666664 | 16 |
| 44575.458333333336 | 17 |
| 44575.46875 | 16.36 |
| 44575.479166666664 | 13.57 |
| 44575.489583333336 | 43.59 |
| 44575.5 | 15.61 |
| 44575.510416666664 | 28.35 |
| 44575.520833333336 | 13.56 |
| 44575.53125 | 13.34 |
| 44575.541666666664 | 14.1 |
| 44575.552083333336 | 14.04 |
| 44575.5625 | 12.81 |
| 44575.572916666664 | 15.19 |
| 44575.583333333336 | 11.81 |
| 44575.59375 | 6.76 |
| 44575.604166666664 | 5.23 |
| 44575.614583333336 | 4.35 |
| 44575.625 | 4.84 |
| 44575.635416666664 | 4.31 |
| 44575.645833333336 | 4.82 |
| 44575.65625 | 4.64 |
| 44575.666666666664 | 4.16 |
| 44575.677083333336 | 4.78 |
| 44575.6875 | 3.77 |
| 44575.697916666664 | 3.91 |
| 44575.708333333336 | 4.06 |
| 44575.71875 | 4.21 |
| 44575.729166666664 | 4.52 |
| 44575.739583333336 | 6.29 |
| 44575.75 | 4.22 |
| 44575.760416666664 | 6.18 |
| 44575.770833333336 | 6.5 |
| 44575.78125 | 5.72 |
| 44575.791666666664 | 6.09 |
| 44575.802083333336 | 6.85 |
| 44575.8125 | 6.98 |
| 44575.822916666664 | 7.74 |
| 44575.833333333336 | 10 |
| 44575.84375 | 11.4 |
| 44575.854166666664 | 10.79 |
| 44575.864583333336 | 12.08 |
| 44575.875 | 12.93 |
| 44575.885416666664 | 13.26 |
| 44575.895833333336 | 13.33 |
| 44575.90625 | 13.13 |
| 44575.916666666664 | 12.73 |
| 44575.927083333336 | 16.98 |
| 44575.9375 | 12.37 |
| 44575.947916666664 | 23.46 |
| 44575.958333333336 | 13.11 |
| 44575.96875 | 14.43 |
| 44575.979166666664 | 17.72 |
| 44575.989583333336 | 17.16 |
| 44576.0 | 15.49 |
| 44576.010416666664 | 15.1 |
| 44576.020833333336 | 16.5 |
| 44576.03125 | 16.55 |
| 44576.041666666664 | 16.52 |
| 44576.052083333336 | 14.95 |
| 44576.0625 | 15.24 |
| 44576.072916666664 | 14.19 |
| 44576.083333333336 | 15.16 |
| 44576.09375 | 14.68 |
| 44576.104166666664 | 13.56 |
| 44576.114583333336 | 13.6 |
| 44576.125 | 14.15 |
| 44576.135416666664 | 15.06 |
| 44576.145833333336 | 13.7 |
| 44576.15625 | 14.45 |
| 44576.166666666664 | 14.61 |
| 44576.177083333336 | 14.73 |
| 44576.1875 | 16.14 |
| 44576.197916666664 | 15.95 |
| 44576.208333333336 | 15.8 |
| 44576.21875 | 16.26 |
| 44576.229166666664 | 17.43 |
| 44576.239583333336 | 19.09 |
| 44576.25 | 17.22 |
| 44576.260416666664 | 17.99 |
| 44576.270833333336 | 17.44 |
| 44576.28125 | 19.86 |
| 44576.291666666664 | 15.44 |
| 44576.302083333336 | 17 |
| 44576.3125 | 18.15 |
| 44576.322916666664 | 15.49 |
| 44576.333333333336 | 521.53 |
| 44576.34375 | 14.64 |
| 44576.354166666664 | 16.59 |
| 44576.364583333336 | 14.12 |
| 44576.375 | 16.3 |
| 44576.385416666664 | 14.23 |
| 44576.395833333336 | 36.82 |
| 44576.40625 | 15.35 |
| 44576.416666666664 | 15.94 |
| 44576.427083333336 | 16.37 |
| 44576.4375 | 19.17 |
| 44576.447916666664 | 18.33 |
| 44576.458333333336 | 18.49 |
| 44576.46875 | 19.66 |
| 44576.479166666664 | 30.66 |
| 44576.489583333336 | 23.27 |
| 44576.5 | 28.24 |
| 44576.510416666664 | 19.99 |
| 44576.520833333336 | 17.27 |
| 44576.53125 | 19.57 |
| 44576.541666666664 | 21.18 |
| 44576.552083333336 | 19.65 |
| 44576.5625 | 18.08 |
| 44576.572916666664 | 13.49 |
| 44576.583333333336 | 13.52 |
| 44576.59375 | 10.6 |
| 44576.604166666664 | 10.1 |
| 44576.614583333336 | 10.13 |
| 44576.625 | 6.98 |
| 44576.635416666664 | 6.54 |
| 44576.645833333336 | 5.88 |
| 44576.65625 | 5.71 |
| 44576.666666666664 | 4.94 |
| 44576.677083333336 | 5.71 |
| 44576.6875 | 5.88 |
| 44576.697916666664 | 12.47 |
| 44576.708333333336 | 7.09 |
| 44576.71875 | 7.09 |
| 44576.729166666664 | 7.48 |
| 44576.739583333336 | 9.67 |
| 44576.75 | 11.55 |
| 44576.760416666664 | 11.64 |
| 44576.770833333336 | 14.51 |
| 44576.78125 | 11.99 |
| 44576.791666666664 | 8.21 |
| 44576.802083333336 | 9.55 |
| 44576.8125 | 11.43 |
| 44576.822916666664 | 14.26 |
| 44576.833333333336 | 15.2 |
| 44576.84375 | 15.61 |
| 44576.854166666664 | 17.89 |
| 44576.864583333336 | 16.2 |
| 44576.875 | 17.12 |
| 44576.885416666664 | 16.82 |
| 44576.895833333336 | 17.05 |
| 44576.90625 | 16.77 |
| 44576.916666666664 | 16.67 |
| 44576.927083333336 | 16.71 |
| 44576.9375 | 17.06 |
| 44576.947916666664 | 28.84 |
| 44576.958333333336 | 18.9 |
| 44576.96875 | 17.4 |
| 44576.979166666664 | 21.18 |
| 44576.989583333336 | 19.77 |
| 44577.0 | 23.14 |
| 44577.010416666664 | 16.8 |
| 44577.020833333336 | 18.79 |
| 44577.03125 | 19.28 |
| 44577.041666666664 | 18.51 |
| 44577.052083333336 | 17.06 |
| 44577.0625 | 19.29 |
| 44577.072916666664 | 17.87 |
| 44577.083333333336 | 16.97 |
| 44577.09375 | 18.73 |
| 44577.104166666664 | 19.06 |
| 44577.114583333336 | 21.71 |
| 44577.125 | 19.27 |
| 44577.135416666664 | 17.01 |
| 44577.145833333336 | 17.14 |
| 44577.15625 | 17.92 |
| 44577.166666666664 | 17.96 |
| 44577.177083333336 | 17.08 |
| 44577.1875 | 17.64 |
| 44577.197916666664 | 20.55 |
| 44577.208333333336 | 19.87 |
| 44577.21875 | 17.88 |
| 44577.229166666664 | 19.16 |
| 44577.239583333336 | 20.6 |
| 44577.25 | 20.2 |
| 44577.260416666664 | 22.87 |
| 44577.270833333336 | 26.19 |
| 44577.28125 | 23.49 |
| 44577.291666666664 | 23.66 |
| 44577.302083333336 | 20.45 |
| 44577.3125 | 23.2 |
| 44577.322916666664 | 18.88 |
| 44577.333333333336 | 22.42 |
| 44577.34375 | 20.2 |
| 44577.354166666664 | 20.72 |
| 44577.364583333336 | 16.63 |
| 44577.375 | 16.52 |
| 44577.385416666664 | 19.39 |
| 44577.395833333336 | 19.76 |
| 44577.40625 | 16.37 |
| 44577.416666666664 | 22.25 |
| 44577.427083333336 | 19.25 |
| 44577.4375 | 25.37 |
| 44577.447916666664 | 19.87 |
| 44577.458333333336 | 18.95 |
| 44577.46875 | 19.85 |
| 44577.479166666664 | 31.51 |
| 44577.489583333336 | 22.3 |
| 44577.5 | 25.95 |
| 44577.510416666664 | 23.44 |
| 44577.520833333336 | 48.75 |
| 44577.53125 | 23.26 |
| 44577.541666666664 | 24.15 |
| 44577.552083333336 | 18.53 |
| 44577.5625 | 23.74 |
| 44577.572916666664 | 18.28 |
| 44577.583333333336 | 21.07 |
| 44577.59375 | 20.11 |
| 44577.604166666664 | 18.7 |
| 44577.614583333336 | 16.25 |
| 44577.625 | 20.04 |
| 44577.635416666664 | 17.99 |
| 44577.645833333336 | 15.63 |
| 44577.65625 | 12.68 |
| 44577.666666666664 | 12.32 |
| 44577.677083333336 | 14.07 |
| 44577.6875 | 11.59 |
| 44577.697916666664 | 13.35 |
| 44577.708333333336 | 14.37 |
| 44577.71875 | 16.38 |
| 44577.729166666664 | 13.98 |
| 44577.739583333336 | 16.41 |
| 44577.75 | 19.06 |
| 44577.760416666664 | 18.29 |
| 44577.770833333336 | 17.38 |
| 44577.78125 | 18.59 |
| 44577.791666666664 | 18.65 |
| 44577.802083333336 | 19.54 |
| 44577.8125 | 19.52 |
| 44577.822916666664 | 21.69 |
| 44577.833333333336 | 20.51 |
| 44577.84375 | 21.43 |
| 44577.854166666664 | 21.42 |
| 44577.864583333336 | 22.36 |
| 44577.875 | 21.45 |
| 44577.885416666664 | 21.06 |
| 44577.895833333336 | 20.93 |
| 44577.90625 | 20.72 |
| 44577.916666666664 | 21.25 |
| 44577.927083333336 | 21.89 |
| 44577.9375 | 23.06 |
| 44577.947916666664 | 23.5 |
| 44577.958333333336 | 25.99 |
| 44577.96875 | 24.15 |
| 44577.979166666664 | 23.25 |
| 44577.989583333336 | 24.71 |
| 44578.0 | 25.1 |
| 44578.010416666664 | 21.32 |
| 44578.020833333336 | 22.21 |
| 44578.03125 | 21.56 |
| 44578.041666666664 | 22.5 |
| 44578.052083333336 | 17.92 |
| 44578.0625 | 25.47 |
| 44578.072916666664 | 22.47 |
| 44578.083333333336 | 22.54 |
| 44578.09375 | 39.21 |
| 44578.104166666664 | 23.39 |
| 44578.114583333336 | 22.64 |
| 44578.125 | 23.5 |
| 44578.135416666664 | 26.87 |
| 44578.145833333336 | 27.04 |
| 44578.15625 | 26.19 |
| 44578.166666666664 | 26.21 |
| 44578.177083333336 | 28.62 |
| 44578.1875 | 30.12 |
| 44578.197916666664 | 25.16 |
| 44578.208333333336 | 26.5 |
| 44578.21875 | 25.37 |
| 44578.229166666664 | 26.39 |
| 44578.239583333336 | 25.85 |
| 44578.25 | 24.15 |
| 44578.260416666664 | 27.42 |
| 44578.270833333336 | 29.25 |
| 44578.28125 | 32.54 |
| 44578.291666666664 | 31.63 |
| 44578.302083333336 | 30.23 |
| 44578.3125 | 35.87 |
| 44578.322916666664 | 36.34 |
| 44578.333333333336 | 33.93 |
| 44578.34375 | 26.37 |
| 44578.354166666664 | 32.63 |
| 44578.364583333336 | 36 |
| 44578.375 | 31.42 |
| 44578.385416666664 | 37.96 |
| 44578.395833333336 | 34.18 |
| 44578.40625 | 38.13 |
| 44578.416666666664 | 30.4 |
| 44578.427083333336 | 29.06 |
| 44578.4375 | 34.31 |
| 44578.447916666664 | 40.03 |
| 44578.458333333336 | 39.57 |
| 44578.46875 | 28.56 |
| 44578.479166666664 | 29.1 |
| 44578.489583333336 | 28.73 |
| 44578.5 | 30.56 |
| 44578.510416666664 | 30.25 |
| 44578.520833333336 | 30.3 |
| 44578.53125 | 28.12 |
| 44578.541666666664 | 28.81 |
| 44578.552083333336 | 29.5 |
| 44578.5625 | 28.7 |
| 44578.572916666664 | 33.24 |
| 44578.583333333336 | 20.54 |
| 44578.59375 | 23.04 |
| 44578.604166666664 | 24.07 |
| 44578.614583333336 | 26.01 |
| 44578.625 | 22.28 |
| 44578.635416666664 | 25.89 |
| 44578.645833333336 | 16.14 |
| 44578.65625 | 22.07 |
| 44578.666666666664 | 12.87 |
| 44578.677083333336 | 24.05 |
| 44578.6875 | 22.47 |
| 44578.697916666664 | 22.83 |
| 44578.708333333336 | 29.45 |
| 44578.71875 | 27.57 |
| 44578.729166666664 | 29.93 |
| 44578.739583333336 | 28.62 |
| 44578.75 | 31.25 |
| 44578.760416666664 | 28.22 |
| 44578.770833333336 | 28.11 |
| 44578.78125 | 29.68 |
| 44578.791666666664 | 23.18 |
| 44578.802083333336 | 27.88 |
| 44578.8125 | 29.51 |
| 44578.822916666664 | 29.2 |
| 44578.833333333336 | 26.7 |
| 44578.84375 | 27.9 |
| 44578.854166666664 | 30.44 |
| 44578.864583333336 | 32.44 |
| 44578.875 | 32.42 |
| 44578.885416666664 | 37.69 |
| 44578.895833333336 | 31.69 |
| 44578.90625 | 37.34 |
| 44578.916666666664 | 35 |
| 44578.927083333336 | 34.4 |
| 44578.9375 | 31.48 |
| 44578.947916666664 | 39.76 |
| 44578.958333333336 | 39.44 |
| 44578.96875 | 38.3 |
| 44578.979166666664 | 37.59 |
| 44578.989583333336 | 39.39 |
| 44579.0 | 34.25 |
| 44579.010416666664 | 50.5 |
| 44579.020833333336 | 33.4 |
| 44579.03125 | 41.63 |
| 44579.041666666664 | 41.83 |
| 44579.052083333336 | 47.38 |
| 44579.0625 | 37.25 |
| 44579.072916666664 | 38.51 |
| 44579.083333333336 | 57.94 |
| 44579.09375 | 43.57 |
| 44579.104166666664 | 33.28 |
| 44579.114583333336 | 38.14 |
| 44579.125 | 36.58 |
| 44579.135416666664 | 37.19 |
| 44579.145833333336 | 32.58 |
| 44579.15625 | 34.74 |
| 44579.166666666664 | 29.63 |
| 44579.177083333336 | 27.25 |
| 44579.1875 | 36.67 |
| 44579.197916666664 | 38.14 |
| 44579.208333333336 | 31.53 |
| 44579.21875 | 44.24 |
| 44579.229166666664 | 29.77 |
| 44579.239583333336 | 31.63 |
| 44579.25 | 35.21 |
| 44579.260416666664 | 29.93 |
| 44579.270833333336 | 41.31 |
| 44579.28125 | 30.86 |
| 44579.291666666664 | 45.63 |
| 44579.302083333336 | 34.68 |
| 44579.3125 | 32.23 |
| 44579.322916666664 | 34.52 |
| 44579.333333333336 | 42.29 |
| 44579.34375 | 48.38 |
| 44579.354166666664 | 30.33 |
| 44579.364583333336 | 58.3 |
| 44579.375 | 31.68 |
| 44579.385416666664 | 37.11 |
| 44579.395833333336 | 47.76 |
| 44579.40625 | 38.65 |
| 44579.416666666664 | 44.32 |
| 44579.427083333336 | 35.86 |
| 44579.4375 | 36.37 |
| 44579.447916666664 | 35.39 |
| 44579.458333333336 | 32.51 |
| 44579.46875 | 37.62 |
| 44579.479166666664 | 35.26 |
| 44579.489583333336 | 38.21 |
| 44579.5 | 40.59 |
| 44579.510416666664 | 48.35 |
| 44579.520833333336 | 30.77 |
| 44579.53125 | 34.9 |
| 44579.541666666664 | 31.74 |
| 44579.552083333336 | 33.6 |
| 44579.5625 | 42.17 |
| 44579.572916666664 | 32.59 |
| 44579.583333333336 | 28.38 |
| 44579.59375 | 28.55 |
| 44579.604166666664 | 29.29 |
| 44579.614583333336 | 24.53 |
| 44579.625 | 20.05 |
| 44579.635416666664 | 18.87 |
| 44579.645833333336 | 18.77 |
| 44579.65625 | 19.07 |
| 44579.666666666664 | 22.33 |
| 44579.677083333336 | 26.09 |
| 44579.6875 | 26.17 |
| 44579.697916666664 | 24.63 |
| 44579.708333333336 | 23.82 |
| 44579.71875 | 20.97 |
| 44579.729166666664 | 19.3 |
| 44579.739583333336 | 21.14 |
| 44579.75 | 21.98 |
| 44579.760416666664 | 17.86 |
| 44579.770833333336 | 17.65 |
| 44579.78125 | 24.72 |
| 44579.791666666664 | 25.23 |
| 44579.802083333336 | 30.7 |
| 44579.8125 | 26.8 |
| 44579.822916666664 | 28.14 |
| 44579.833333333336 | 27.99 |
| 44579.84375 | 22.55 |
| 44579.854166666664 | 28.55 |
| 44579.864583333336 | 31.88 |
| 44579.875 | 33.04 |
| 44579.885416666664 | 30.19 |
| 44579.895833333336 | 32.59 |
| 44579.90625 | 43.5 |
| 44579.916666666664 | 34.56 |
| 44579.927083333336 | 30.14 |
| 44579.9375 | 35.97 |
| 44579.947916666664 | 31.01 |
| 44579.958333333336 | 33.68 |
| 44579.96875 | 33.38 |
| 44579.979166666664 | 33.2 |
| 44579.989583333336 | 23.77 |
| 44580.0 | 48.22 |
| 44580.010416666664 | 33.03 |
| 44580.020833333336 | 32.97 |
| 44580.03125 | 36.44 |
| 44580.041666666664 | 38.83 |
| 44580.052083333336 | 50.29 |
| 44580.0625 | 31.32 |
| 44580.072916666664 | 30.75 |
| 44580.083333333336 | 41.64 |
| 44580.09375 | 43.65 |
| 44580.104166666664 | 35.71 |
| 44580.114583333336 | 42.46 |
| 44580.125 | 38.87 |
| 44580.135416666664 | 32.17 |
| 44580.145833333336 | 29.68 |
| 44580.15625 | 30.75 |
| 44580.166666666664 | 27.81 |
| 44580.177083333336 | 32.83 |
| 44580.1875 | 44.89 |
| 44580.197916666664 | 32.94 |
| 44580.208333333336 | 32.94 |
| 44580.21875 | 27.83 |
| 44580.229166666664 | 31.37 |
| 44580.239583333336 | 29.62 |
| 44580.25 | 33.26 |
| 44580.260416666664 | 30.63 |
| 44580.270833333336 | 33.94 |
| 44580.28125 | 25.36 |
| 44580.291666666664 | 31.6 |
| 44580.302083333336 | 30.9 |
| 44580.3125 | 49.29 |
| 44580.322916666664 | 52.37 |
| 44580.333333333336 | 43.12 |
| 44580.34375 | 38.46 |
| 44580.354166666664 | 31.2 |
| 44580.364583333336 | 51.03 |
| 44580.375 | 38.2 |
| 44580.385416666664 | 37.34 |
| 44580.395833333336 | 32.64 |
| 44580.40625 | 36.39 |
| 44580.416666666664 | 37.44 |
| 44580.427083333336 | 38.96 |
| 44580.4375 | 30.87 |
| 44580.447916666664 | 30.64 |
| 44580.458333333336 | 30.42 |
| 44580.46875 | 32.4 |
| 44580.479166666664 | 29.43 |
| 44580.489583333336 | 29.66 |
| 44580.5 | 32.49 |
| 44580.510416666664 | 34.47 |
| 44580.520833333336 | 27.39 |
| 44580.53125 | 30.56 |
| 44580.541666666664 | 31.02 |
| 44580.552083333336 | 29.86 |
| 44580.5625 | 36.6 |
| 44580.572916666664 | 18.22 |
| 44580.583333333336 | 19.48 |
| 44580.59375 | 14.22 |
| 44580.604166666664 | 13.51 |
| 44580.614583333336 | 19.77 |
| 44580.625 | 27.5 |
| 44580.635416666664 | 14.7 |
| 44580.645833333336 | 12.42 |
| 44580.65625 | 17.24 |
| 44580.666666666664 | 9.9 |
| 44580.677083333336 | 9.72 |
| 44580.6875 | 10.65 |
| 44580.697916666664 | 12.33 |
| 44580.708333333336 | 12.01 |
| 44580.71875 | 13.48 |
| 44580.729166666664 | 14.21 |
| 44580.739583333336 | 16.27 |
| 44580.75 | 24.68 |
| 44580.760416666664 | 18.38 |
| 44580.770833333336 | 19.02 |
| 44580.78125 | 40.29 |
| 44580.791666666664 | 25.4 |
| 44580.802083333336 | 23.79 |
| 44580.8125 | 29.67 |
| 44580.833333333336 | 24.28 |
| 44580.84375 | 28.82 |
| 44580.854166666664 | 29.24 |
| 44580.864583333336 | 33.96 |
| 44580.875 | 30.16 |
| 44580.885416666664 | 31.08 |
| 44580.895833333336 | 32.35 |
| 44580.90625 | 34.21 |
| 44580.916666666664 | 35.58 |
| 44580.927083333336 | 37.58 |
| 44580.9375 | 43.54 |
| 44580.947916666664 | 34.5 |
| 44580.958333333336 | 36.51 |
| 44580.96875 | 31.69 |
| 44580.979166666664 | 36.1 |
| 44580.989583333336 | 32.78 |
| 44581.0 | 31.67 |
| 44581.010416666664 | 31.93 |
| 44581.020833333336 | 31.59 |
| 44581.03125 | 25.58 |
| 44581.041666666664 | 34.78 |
| 44581.052083333336 | 28.32 |
| 44581.0625 | 33.9 |
| 44581.072916666664 | 32.04 |
| 44581.083333333336 | 34.99 |
| 44581.09375 | 36.4 |
| 44581.104166666664 | 30.85 |
| 44581.114583333336 | 44.39 |
| 44581.125 | 45.08 |
| 44581.135416666664 | 29.86 |
| 44581.145833333336 | 27.29 |
| 44581.15625 | 28.04 |
| 44581.166666666664 | 27.42 |
| 44581.177083333336 | 24.54 |
| 44581.1875 | 26.72 |
| 44581.197916666664 | 26.74 |
| 44581.208333333336 | 28.34 |
| 44581.21875 | 26.75 |
| 44581.229166666664 | 27.49 |
| 44581.239583333336 | 29.14 |
| 44581.25 | 34.89 |
| 44581.260416666664 | 30.52 |
| 44581.270833333336 | 35.98 |
| 44581.28125 | 28.46 |
| 44581.291666666664 | 31.71 |
| 44581.302083333336 | 34.38 |
| 44581.3125 | 34.05 |
| 44581.322916666664 | 31.33 |
| 44581.333333333336 | 33.64 |
| 44581.34375 | 39.74 |
| 44581.354166666664 | 52.12 |
| 44581.364583333336 | 30.77 |
| 44581.375 | 37.21 |
| 44581.385416666664 | 36.37 |
| 44581.395833333336 | 34.88 |
| 44581.40625 | 36.29 |
| 44581.416666666664 | 36.95 |
| 44581.427083333336 | 40.58 |
| 44581.4375 | 29.61 |
| 44581.447916666664 | 32.43 |
| 44581.458333333336 | 31.27 |
| 44581.46875 | 33.82 |
| 44581.479166666664 | 26.17 |
| 44581.489583333336 | 24.99 |
| 44581.5 | 27.76 |
| 44581.510416666664 | 29.4 |
| 44581.520833333336 | 29.02 |
| 44581.53125 | 25.37 |
| 44581.541666666664 | 23.79 |
| 44581.552083333336 | 25.66 |
| 44581.5625 | 26.77 |
| 44581.572916666664 | 24.94 |
| 44581.583333333336 | 27 |
| 44581.59375 | 27.59 |
| 44581.604166666664 | 22.9 |
| 44581.614583333336 | 23.47 |
| 44581.625 | 21.32 |
| 44581.635416666664 | 26.55 |
| 44581.645833333336 | 20.83 |
| 44581.65625 | 22.34 |
| 44581.666666666664 | 21.8 |
| 44581.677083333336 | 21.64 |
| 44581.6875 | 22.61 |
| 44581.697916666664 | 21.08 |
| 44581.708333333336 | 22.52 |
| 44581.71875 | 23.15 |
| 44581.729166666664 | 22.88 |
| 44581.739583333336 | 23.34 |
| 44581.75 | 26.28 |
| 44581.760416666664 | 27.39 |
| 44581.770833333336 | 28.41 |
| 44581.78125 | 31.44 |
| 44581.791666666664 | 32.23 |
| 44581.802083333336 | 30.94 |
| 44581.8125 | 34.35 |
| 44581.822916666664 | 35.64 |
| 44581.833333333336 | 32.84 |
| 44581.84375 | 34.44 |
| 44581.854166666664 | 41.73 |
| 44581.864583333336 | 34.16 |
| 44581.875 | 37.41 |
| 44581.885416666664 | 45.87 |
| 44581.895833333336 | 39.63 |
| 44581.90625 | 30.27 |
| 44581.916666666664 | 55.38 |
| 44581.927083333336 | 54.56 |
| 44581.9375 | 44.2 |
| 44581.947916666664 | 45.51 |
| 44581.958333333336 | 45.36 |
| 44581.96875 | 41.82 |
| 44581.979166666664 | 37.48 |
| 44581.989583333336 | 41.65 |
| 44582.0 | 46.84 |
| 44582.010416666664 | 40.33 |
| 44582.020833333336 | 38.17 |
| 44582.03125 | 33.43 |
| 44582.041666666664 | 39.16 |
| 44582.052083333336 | 32.8 |
| 44582.0625 | 23.69 |
| 44582.072916666664 | 25.22 |
| 44582.083333333336 | 18.6 |
| 44582.09375 | 30.78 |
| 44582.104166666664 | 26.79 |
| 44582.114583333336 | 29.48 |
| 44582.125 | 35.8 |
| 44582.135416666664 | 32.96 |
| 44582.145833333336 | 40.36 |
| 44582.15625 | 38.37 |
| 44582.166666666664 | 33.28 |
| 44582.177083333336 | 27.42 |
| 44582.1875 | 28.8 |
| 44582.197916666664 | 25.56 |
| 44582.208333333336 | 29.62 |
| 44582.21875 | 25.07 |
| 44582.229166666664 | 21.36 |
| 44582.239583333336 | 26.18 |
| 44582.25 | 24.8 |
| 44582.260416666664 | 20.74 |
| 44582.270833333336 | 23.07 |
| 44582.28125 | 49.38 |
| 44582.291666666664 | 39.95 |
| 44582.302083333336 | 36.3 |
| 44582.3125 | 39.1 |
| 44582.322916666664 | 32.11 |
| 44582.333333333336 | 37.84 |
| 44582.34375 | 29.36 |
| 44582.354166666664 | 36.09 |
| 44582.364583333336 | 36.02 |
| 44582.375 | 29.72 |
| 44582.385416666664 | 44.76 |
| 44582.395833333336 | 51.89 |
| 44582.40625 | 42.23 |
| 44582.416666666664 | 56.15 |
| 44582.427083333336 | 41.58 |
| 44582.4375 | 38.22 |
| 44582.447916666664 | 37.37 |
| 44582.458333333336 | 52.77 |
| 44582.46875 | 45.93 |
| 44582.479166666664 | 34.3 |
| 44582.489583333336 | 28.08 |
| 44582.5 | 30.3 |
| 44582.510416666664 | 40.48 |
| 44582.520833333336 | 28 |
| 44582.53125 | 30.02 |
| 44582.541666666664 | 31.74 |
| 44582.552083333336 | 37.66 |
| 44582.5625 | 31.81 |
| 44582.572916666664 | 34.21 |
| 44582.583333333336 | 31.95 |
| 44582.59375 | 34.34 |
| 44582.604166666664 | 31.49 |
| 44582.614583333336 | 31.09 |
| 44582.625 | 32.9 |
| 44582.635416666664 | 37.61 |
| 44582.645833333336 | 31.08 |
| 44582.65625 | 31.31 |
| 44582.666666666664 | 27.56 |
| 44582.677083333336 | 30.79 |
| 44582.6875 | 23.4 |
| 44582.697916666664 | 25.94 |
| 44582.708333333336 | 28.91 |
| 44582.71875 | 23.5 |
| 44582.729166666664 | 23.85 |
| 44582.739583333336 | 21.27 |
| 44582.75 | 21.62 |
| 44582.760416666664 | 23.56 |
| 44582.770833333336 | 21.12 |
| 44582.78125 | 26.56 |
| 44582.791666666664 | 19.06 |
| 44582.802083333336 | 32.15 |
| 44582.8125 | 55.87 |
| 44582.822916666664 | 52.93 |
| 44582.833333333336 | 55.84 |
| 44582.84375 | 43.41 |
| 44582.854166666664 | 40.47 |
| 44582.864583333336 | 43.46 |
| 44582.875 | 47.26 |
| 44582.885416666664 | 59.01 |
| 44582.895833333336 | 49.28 |
| 44582.90625 | 43.85 |
| 44582.916666666664 | 36.38 |
| 44582.927083333336 | 41.82 |
| 44582.9375 | 48.27 |
| 44582.947916666664 | 42.49 |
| 44582.958333333336 | 38.07 |
| 44582.96875 | 46.59 |
| 44582.979166666664 | 38.25 |
| 44582.989583333336 | 46.96 |
| 44583.0 | 33.97 |
| 44583.010416666664 | 35.48 |
| 44583.020833333336 | 57.49 |
| 44583.03125 | 46.88 |
| 44583.041666666664 | 32.23 |
| 44583.052083333336 | 38.66 |
| 44583.0625 | 34.47 |
| 44583.072916666664 | 33.39 |
| 44583.083333333336 | 35.47 |
| 44583.09375 | 39.26 |
| 44583.104166666664 | 37.11 |
| 44583.114583333336 | 39.81 |
| 44583.125 | 31.36 |
| 44583.135416666664 | 38.01 |
| 44583.145833333336 | 42.06 |
| 44583.15625 | 36.61 |
| 44583.166666666664 | 39.1 |
| 44583.177083333336 | 43.67 |
| 44583.1875 | 33.89 |
| 44583.197916666664 | 42.93 |
| 44583.208333333336 | 34.49 |
| 44583.21875 | 35.68 |
| 44583.229166666664 | 39.15 |
| 44583.239583333336 | 34.74 |
| 44583.25 | 31.2 |
| 44583.260416666664 | 28.01 |
| 44583.270833333336 | 40.83 |
| 44583.28125 | 27.67 |
| 44583.291666666664 | 29.64 |
| 44583.302083333336 | 30.21 |
| 44583.3125 | 37.58 |
| 44583.322916666664 | 53.14 |
| 44583.333333333336 | 37.32 |
| 44583.34375 | 35.18 |
| 44583.354166666664 | 35.62 |
| 44583.364583333336 | 41.09 |
| 44583.375 | 51.9 |
| 44583.385416666664 | 38.95 |
| 44583.395833333336 | 40.21 |
| 44583.40625 | 39.27 |
| 44583.416666666664 | 42.34 |
| 44583.427083333336 | 43.21 |
| 44583.4375 | 69.37 |
| 44583.447916666664 | 39.25 |
| 44583.458333333336 | 40.04 |
| 44583.46875 | 38.28 |
| 44583.479166666664 | 44.57 |
| 44583.489583333336 | 52.44 |
| 44583.5 | 44.89 |
| 44583.510416666664 | 37.71 |
| 44583.520833333336 | 40.42 |
| 44583.53125 | 31.26 |
| 44583.541666666664 | 37.1 |
| 44583.552083333336 | 34.35 |
| 44583.5625 | 34.74 |
| 44583.572916666664 | 26.44 |
| 44583.583333333336 | 34.8 |
| 44583.59375 | 39.17 |
| 44583.604166666664 | 21.23 |
| 44583.614583333336 | 17.5 |
| 44583.625 | 15.75 |
| 44583.635416666664 | 13.12 |
| 44583.645833333336 | 15.68 |
| 44583.65625 | 16.4 |
| 44583.666666666664 | 11.86 |
| 44583.677083333336 | 12.31 |
| 44583.6875 | 13.34 |
| 44583.697916666664 | 18.88 |
| 44583.708333333336 | 13.02 |
| 44583.71875 | 18.68 |
| 44583.729166666664 | 11.93 |
| 44583.739583333336 | 10.16 |
| 44583.75 | 7.96 |
| 44583.760416666664 | 7.54 |
| 44583.770833333336 | 6.89 |
| 44583.78125 | 7.65 |
| 44583.791666666664 | 7.34 |
| 44583.802083333336 | 7.89 |
| 44583.8125 | 8.84 |
| 44583.822916666664 | 9.89 |
| 44583.833333333336 | 32 |
| 44583.84375 | 26 |
| 44583.854166666664 | 27 |
| 44583.864583333336 | 35.2 |
| 44583.875 | 25.37 |
| 44583.885416666664 | 22.87 |
| 44583.895833333336 | 25.87 |
| 44583.90625 | 28.8 |
| 44583.916666666664 | 29.46 |
| 44583.927083333336 | 30.87 |
| 44583.9375 | 32.82 |
| 44583.947916666664 | 44.8 |
| 44583.958333333336 | 42.07 |
| 44583.96875 | 35.59 |
| 44583.979166666664 | 44.31 |
| 44583.989583333336 | 38.89 |
| 44584.0 | 42.29 |
| 44584.010416666664 | 35.35 |
| 44584.020833333336 | 42.12 |
| 44584.03125 | 35.72 |
| 44584.041666666664 | 35.34 |
| 44584.052083333336 | 35.91 |
| 44584.0625 | 33.87 |
| 44584.072916666664 | 31.62 |
| 44584.083333333336 | 30.04 |
| 44584.09375 | 36.76 |
| 44584.104166666664 | 30.28 |
| 44584.114583333336 | 29.03 |
| 44584.125 | 30 |
| 44584.135416666664 | 32.37 |
| 44584.145833333336 | 31.71 |
| 44584.15625 | 32.28 |
| 44584.166666666664 | 32.33 |
| 44584.177083333336 | 44.39 |
| 44584.1875 | 26.56 |
| 44584.197916666664 | 49.87 |
| 44584.208333333336 | 42.97 |
| 44584.21875 | 39.58 |
| 44584.229166666664 | 33.52 |
| 44584.239583333336 | 28.79 |
| 44584.25 | 28.41 |
| 44584.260416666664 | 36.34 |
| 44584.270833333336 | 32.88 |
| 44584.28125 | 36.69 |
| 44584.291666666664 | 29.07 |
| 44584.302083333336 | 30.4 |
| 44584.3125 | 26.34 |
| 44584.322916666664 | 26.51 |
| 44584.333333333336 | 28.4 |
| 44584.34375 | 29.53 |
| 44584.354166666664 | 31.15 |
| 44584.364583333336 | 30.45 |
| 44584.375 | 34.92 |
| 44584.385416666664 | 40.84 |
| 44584.395833333336 | 31.72 |
| 44584.40625 | 33.35 |
| 44584.416666666664 | 29.51 |
| 44584.427083333336 | 32.06 |
| 44584.4375 | 33.79 |
| 44584.447916666664 | 39.56 |
| 44584.458333333336 | 50.56 |
| 44584.46875 | 45.04 |
| 44584.479166666664 | 38.87 |
| 44584.489583333336 | 36.26 |
| 44584.5 | 35.4 |
| 44584.510416666664 | 48.35 |
| 44584.520833333336 | 38.09 |
| 44584.53125 | 35.4 |
| 44584.541666666664 | 38.23 |
| 44584.552083333336 | 21.32 |
| 44584.5625 | 12.92 |
| 44584.572916666664 | 10.39 |
| 44584.583333333336 | 27.58 |
| 44584.59375 | 17.3 |
| 44584.604166666664 | 9.54 |
| 44584.614583333336 | 9.51 |
| 44584.625 | 8.7 |
| 44584.635416666664 | 7.6 |
| 44584.645833333336 | 8.25 |
| 44584.65625 | 9.01 |
| 44584.666666666664 | 9.27 |
| 44584.677083333336 | 7.21 |
| 44584.6875 | 7.03 |
| 44584.697916666664 | 8.19 |
| 44584.708333333336 | 7.98 |
| 44584.71875 | 7.96 |
| 44584.729166666664 | 18.5 |
| 44584.739583333336 | 10.15 |
| 44584.75 | 8.11 |
| 44584.760416666664 | 6.46 |
| 44584.770833333336 | 5.47 |
| 44584.78125 | 4.87 |
| 44584.791666666664 | 5.25 |
| 44584.802083333336 | 9.3 |
| 44584.8125 | 7.24 |
| 44584.822916666664 | 10.91 |
| 44584.833333333336 | 11.05 |
| 44584.84375 | 11.45 |
| 44584.854166666664 | 11.15 |
| 44584.864583333336 | 11.16 |
| 44584.875 | 14.79 |
| 44584.885416666664 | 18.34 |
| 44584.895833333336 | 21.51 |
| 44584.90625 | 23.48 |
| 44584.916666666664 | 25.93 |
| 44584.927083333336 | 28.44 |
| 44584.9375 | 31.14 |
| 44584.947916666664 | 28.55 |
| 44584.958333333336 | 30.42 |
| 44584.96875 | 33.76 |
| 44584.979166666664 | 33.35 |
| 44584.989583333336 | 31.9 |
| 44585.0 | 29.63 |
| 44585.010416666664 | 40.41 |
| 44585.020833333336 | 32.92 |
| 44585.03125 | 38.38 |
| 44585.041666666664 | 33.6 |
| 44585.052083333336 | 28.58 |
| 44585.0625 | 35.3 |
| 44585.072916666664 | 29.07 |
| 44585.083333333336 | 28.97 |
| 44585.09375 | 30.83 |
| 44585.104166666664 | 29.38 |
| 44585.114583333336 | 31.07 |
| 44585.125 | 27.81 |
| 44585.135416666664 | 28.12 |
| 44585.145833333336 | 27.89 |
| 44585.15625 | 22.91 |
| 44585.166666666664 | 31.77 |
| 44585.177083333336 | 34.14 |
| 44585.1875 | 28.59 |
| 44585.197916666664 | 30.4 |
| 44585.208333333336 | 26.54 |
| 44585.21875 | 61.75 |
| 44585.229166666664 | 40.19 |
| 44585.239583333336 | 27.04 |
| 44585.25 | 40.63 |
| 44585.260416666664 | 27.6 |
| 44585.270833333336 | 32.92 |
| 44585.28125 | 36.36 |
| 44585.291666666664 | 26.37 |
| 44585.302083333336 | 26.05 |
| 44585.3125 | 27.33 |
| 44585.322916666664 | 28.33 |
| 44585.333333333336 | 28.64 |
| 44585.34375 | 27.06 |
| 44585.354166666664 | 30.69 |
| 44585.364583333336 | 29.5 |
| 44585.375 | 30.47 |
| 44585.385416666664 | 70.38 |
| 44585.395833333336 | 31.71 |
| 44585.40625 | 28.89 |
| 44585.416666666664 | 33.27 |
| 44585.427083333336 | 31.9 |
| 44585.4375 | 32.39 |
| 44585.447916666664 | 30.69 |
| 44585.458333333336 | 31.59 |
| 44585.46875 | 32.69 |
| 44585.479166666664 | 34.07 |
| 44585.489583333336 | 39.24 |
| 44585.5 | 41.08 |
| 44585.510416666664 | 41.45 |
| 44585.520833333336 | 33.06 |
| 44585.53125 | 32.88 |
| 44585.541666666664 | 27.57 |
| 44585.552083333336 | 29.35 |
| 44585.5625 | 21.38 |
| 44585.572916666664 | 29.49 |
| 44585.583333333336 | 83.56 |
| 44585.59375 | 15.82 |
| 44585.604166666664 | 14.32 |
| 44585.614583333336 | 10.18 |
| 44585.625 | 7.58 |
| 44585.635416666664 | 6.91 |
| 44585.645833333336 | 7.31 |
| 44585.65625 | 6.75 |
| 44585.666666666664 | 6.74 |
| 44585.677083333336 | 7.33 |
| 44585.6875 | 6.38 |
| 44585.697916666664 | 6.73 |
| 44585.708333333336 | 6.13 |
| 44585.71875 | 6.42 |
| 44585.729166666664 | 5.97 |
| 44585.739583333336 | 5.9 |
| 44585.75 | 9.46 |
| 44585.760416666664 | 7.02 |
| 44585.770833333336 | 8.04 |
| 44585.78125 | 5.5 |
| 44585.791666666664 | 5.8 |
| 44585.802083333336 | 6.75 |
| 44585.8125 | 7.77 |
| 44585.822916666664 | 6.43 |
| 44585.833333333336 | 8.93 |
| 44585.84375 | 10.76 |
| 44585.854166666664 | 10.46 |
| 44585.864583333336 | 14.4 |
| 44585.875 | 13.99 |
| 44585.885416666664 | 17.73 |
| 44585.895833333336 | 21.82 |
| 44585.90625 | 23.12 |
| 44585.916666666664 | 25.36 |
| 44585.927083333336 | 27.44 |
| 44585.9375 | 28.54 |
| 44585.947916666664 | 28.77 |
| 44585.958333333336 | 37.93 |
| 44585.96875 | 25.99 |
| 44585.979166666664 | 34.63 |
| 44585.989583333336 | 35.15 |
| 44586.0 | 30.72 |
| 44586.010416666664 | 32.53 |
| 44586.020833333336 | 46.88 |
| 44586.03125 | 35.91 |
| 44586.041666666664 | 40.77 |
| 44586.052083333336 | 40.14 |
| 44586.0625 | 35.55 |
| 44586.072916666664 | 36.58 |
| 44586.083333333336 | 37.14 |
| 44586.09375 | 44.48 |
| 44586.104166666664 | 36.19 |
| 44586.114583333336 | 34.12 |
| 44586.125 | 28.96 |
| 44586.135416666664 | 27.5 |
| 44586.145833333336 | 29.39 |
| 44586.15625 | 37.17 |
| 44586.166666666664 | 28.39 |
| 44586.177083333336 | 28.16 |
| 44586.1875 | 26.82 |
| 44586.197916666664 | 28.65 |
| 44586.208333333336 | 37.72 |
| 44586.21875 | 28.87 |
| 44586.229166666664 | 24.17 |
| 44586.239583333336 | 31.94 |
| 44586.25 | 25.72 |
| 44586.260416666664 | 28.78 |
| 44586.270833333336 | 39.29 |
| 44586.28125 | 36.18 |
| 44586.291666666664 | 28.27 |
| 44586.302083333336 | 29.21 |
| 44586.3125 | 30.91 |
| 44586.322916666664 | 23.08 |
| 44586.333333333336 | 27.66 |
| 44586.34375 | 26.38 |
| 44586.354166666664 | 26.48 |
| 44586.364583333336 | 25.57 |
| 44586.375 | 25.78 |
| 44586.385416666664 | 26.08 |
| 44586.395833333336 | 27.41 |
| 44586.40625 | 29.67 |
| 44586.416666666664 | 30.84 |
| 44586.427083333336 | 29.81 |
| 44586.4375 | 28.32 |
| 44586.447916666664 | 31.02 |
| 44586.458333333336 | 32.74 |
| 44586.46875 | 29.84 |
| 44586.479166666664 | 33.59 |
| 44586.489583333336 | 30.62 |
| 44586.5 | 31.47 |
| 44586.510416666664 | 35.76 |
| 44586.520833333336 | 35.86 |
| 44586.53125 | 34.75 |
| 44586.541666666664 | 37.53 |
| 44586.552083333336 | 45.48 |
| 44586.5625 | 51.88 |
| 44586.572916666664 | 35.31 |
| 44586.583333333336 | 33.72 |
| 44586.59375 | 40.51 |
| 44586.604166666664 | 33.47 |
| 44586.614583333336 | 31.29 |
| 44586.625 | 28.85 |
| 44586.635416666664 | 23.45 |
| 44586.645833333336 | 21.85 |
| 44586.65625 | 18.49 |
| 44586.666666666664 | 18.66 |
| 44586.677083333336 | 22.33 |
| 44586.6875 | 16.45 |
| 44586.697916666664 | 16.65 |
| 44586.708333333336 | 19.77 |
| 44586.71875 | 14.9 |
| 44586.729166666664 | 26.33 |
| 44586.739583333336 | 16.08 |
| 44586.75 | 18.69 |
| 44586.760416666664 | 20.13 |
| 44586.770833333336 | 24.67 |
| 44586.78125 | 37.7 |
| 44586.791666666664 | 20.63 |
| 44586.802083333336 | 18.52 |
| 44586.8125 | 26.36 |
| 44586.822916666664 | 19.93 |
| 44586.833333333336 | 20.13 |
| 44586.84375 | 20.32 |
| 44586.854166666664 | 18.47 |
| 44586.864583333336 | 20.27 |
| 44586.875 | 22.83 |
| 44586.885416666664 | 22.36 |
| 44586.895833333336 | 28.5 |
| 44586.90625 | 27 |
| 44586.916666666664 | 29.45 |
| 44586.927083333336 | 29.06 |
| 44586.9375 | 35.79 |
| 44586.947916666664 | 35.21 |
| 44586.958333333336 | 35.65 |
| 44586.96875 | 47.91 |
| 44586.979166666664 | 40.94 |
| 44586.989583333336 | 36.25 |
| 44587.0 | 38.35 |
| 44587.010416666664 | 39.16 |
| 44587.020833333336 | 37.93 |
| 44587.03125 | 38.18 |
| 44587.041666666664 | 46.51 |
| 44587.052083333336 | 58.08 |
| 44587.0625 | 52.94 |
| 44587.072916666664 | 45.15 |
| 44587.083333333336 | 37.37 |
| 44587.09375 | 59.74 |
| 44587.104166666664 | 46.72 |
| 44587.114583333336 | 43.58 |
| 44587.125 | 43.17 |
| 44587.135416666664 | 39.16 |
| 44587.145833333336 | 32.12 |
| 44587.15625 | 32.04 |
| 44587.166666666664 | 40.66 |
| 44587.177083333336 | 32.84 |
| 44587.1875 | 30.72 |
| 44587.197916666664 | 25.56 |
| 44587.208333333336 | 28.95 |
| 44587.21875 | 37.98 |
| 44587.229166666664 | 29.4 |
| 44587.239583333336 | 27.98 |
| 44587.25 | 24.82 |
| 44587.260416666664 | 27.36 |
| 44587.270833333336 | 30.42 |
| 44587.28125 | 31.3 |
| 44587.291666666664 | 28.16 |
| 44587.302083333336 | 42.96 |
| 44587.3125 | 32.55 |
| 44587.322916666664 | 28.92 |
| 44587.333333333336 | 29.17 |
| 44587.34375 | 32.71 |
| 44587.354166666664 | 28.97 |
| 44587.364583333336 | 35.42 |
| 44587.375 | 30.26 |
| 44587.385416666664 | 32.77 |
| 44587.395833333336 | 38.07 |
| 44587.40625 | 40.07 |
| 44587.416666666664 | 28.16 |
| 44587.427083333336 | 29.56 |
| 44587.4375 | 29.95 |
| 44587.447916666664 | 26.42 |
| 44587.458333333336 | 34.72 |
| 44587.46875 | 32.25 |
| 44587.479166666664 | 28.48 |
| 44587.489583333336 | 27.42 |
| 44587.5 | 42.94 |
| 44587.510416666664 | 39.83 |
| 44587.520833333336 | 33.82 |
| 44587.53125 | 33.81 |
| 44587.541666666664 | 43.86 |
| 44587.552083333336 | 40.55 |
| 44587.5625 | 42.58 |
| 44587.572916666664 | 40.55 |
| 44587.583333333336 | 42.23 |
| 44587.59375 | 38.7 |
| 44587.604166666664 | 25.84 |
| 44587.614583333336 | 25.77 |
| 44587.625 | 26.2 |
| 44587.635416666664 | 27.96 |
| 44587.645833333336 | 15.01 |
| 44587.65625 | 18.78 |
| 44587.666666666664 | 11.44 |
| 44587.677083333336 | 11.7 |
| 44587.6875 | 9.45 |
| 44587.697916666664 | 12.44 |
| 44587.708333333336 | 9.25 |
| 44587.71875 | 8.11 |
| 44587.729166666664 | 8.92 |
| 44587.739583333336 | 7.84 |
| 44587.75 | 7.64 |
| 44587.760416666664 | 8.8 |
| 44587.770833333336 | 8.65 |
| 44587.78125 | 9.7 |
| 44587.791666666664 | 9.63 |
| 44587.802083333336 | 8.95 |
| 44587.8125 | 11.05 |
| 44587.822916666664 | 17.82 |
| 44587.833333333336 | 19.92 |
| 44587.84375 | 24.17 |
| 44587.854166666664 | 21.62 |
| 44587.864583333336 | 20.54 |
| 44587.875 | 19.89 |
| 44587.885416666664 | 22.12 |
| 44587.895833333336 | 24.44 |
| 44587.90625 | 26.47 |
| 44587.916666666664 | 25.91 |
| 44587.927083333336 | 28.63 |
| 44587.9375 | 28.7 |
| 44587.947916666664 | 33.42 |
| 44587.958333333336 | 32.2 |
| 44587.96875 | 41.27 |
| 44587.979166666664 | 39.34 |
| 44587.989583333336 | 37.52 |
| 44588.0 | 38.65 |
| 44588.010416666664 | 41.35 |
| 44588.020833333336 | 48.25 |
| 44588.03125 | 46.43 |
| 44588.041666666664 | 41.7 |
| 44588.052083333336 | 43.38 |
| 44588.0625 | 44.08 |
| 44588.072916666664 | 46.26 |
| 44588.083333333336 | 45.06 |
| 44588.09375 | 54.77 |
| 44588.104166666664 | 55.09 |
| 44588.114583333336 | 46.19 |
| 44588.125 | 54.86 |
| 44588.135416666664 | 50.52 |
| 44588.145833333336 | 47.91 |
| 44588.15625 | 45.31 |
| 44588.166666666664 | 45.36 |
| 44588.177083333336 | 43.41 |
| 44588.1875 | 48.15 |
| 44588.197916666664 | 41.78 |
| 44588.208333333336 | 33.22 |
| 44588.21875 | 53.61 |
| 44588.229166666664 | 34.03 |
| 44588.239583333336 | 36.16 |
| 44588.25 | 36.91 |
| 44588.260416666664 | 31.37 |
| 44588.270833333336 | 27.94 |
| 44588.28125 | 35.43 |
| 44588.291666666664 | 30.5 |
| 44588.302083333336 | 29.06 |
| 44588.3125 | 27.1 |
| 44588.322916666664 | 32.71 |
| 44588.333333333336 | 44.75 |
| 44588.34375 | 41.92 |
| 44588.354166666664 | 34.76 |
| 44588.364583333336 | 33.61 |
| 44588.375 | 36.67 |
| 44588.385416666664 | 30.74 |
| 44588.395833333336 | 42.03 |
| 44588.40625 | 41.37 |
| 44588.416666666664 | 29.64 |
| 44588.427083333336 | 41.47 |
| 44588.4375 | 523.89 |
| 44588.447916666664 | 220.08 |
| 44588.458333333336 | 175.1 |
| 44588.46875 | 46.74 |
| 44588.479166666664 | 37.78 |
| 44588.489583333336 | 27.6 |
| 44588.5 | 30.7 |
| 44588.510416666664 | 36.25 |
| 44588.520833333336 | 33.06 |
| 44588.53125 | 39.65 |
| 44588.541666666664 | 29.52 |
| 44588.552083333336 | 23.07 |
| 44588.5625 | 19.71 |
| 44588.572916666664 | 16.14 |
| 44588.583333333336 | 12.3 |
| 44588.59375 | 11.83 |
| 44588.604166666664 | 9.91 |
| 44588.614583333336 | 9.88 |
| 44588.625 | 12.87 |
| 44588.635416666664 | 11.44 |
| 44588.645833333336 | 10.12 |
| 44588.65625 | 10.28 |
| 44588.666666666664 | 16.37 |
| 44588.677083333336 | 9.76 |
| 44588.6875 | 26.27 |
| 44588.697916666664 | 25.31 |
| 44588.708333333336 | 24.36 |
| 44588.71875 | 26.59 |
| 44588.729166666664 | 25.89 |
| 44588.739583333336 | 25.75 |
| 44588.75 | 23.24 |
| 44588.760416666664 | 23.37 |
| 44588.770833333336 | 24.19 |
| 44588.78125 | 24.98 |
| 44588.791666666664 | 22.44 |
| 44588.802083333336 | 22.7 |
| 44588.8125 | 23.83 |
| 44588.822916666664 | 23.78 |
| 44588.833333333336 | 25.98 |
| 44588.84375 | 25.09 |
| 44588.854166666664 | 29.67 |
| 44588.864583333336 | 27.81 |
| 44588.875 | 35.37 |
| 44588.885416666664 | 36.46 |
| 44588.895833333336 | 36.34 |
| 44588.90625 | 36.67 |
| 44588.916666666664 | 36.02 |
| 44588.927083333336 | 37.57 |
| 44588.9375 | 33.69 |
| 44588.947916666664 | 41.34 |
| 44588.958333333336 | 41.13 |
| 44588.96875 | 41.08 |
| 44588.979166666664 | 39.5 |
| 44588.989583333336 | 43.3 |
| 44589.0 | 41.99 |
| 44589.010416666664 | 44.92 |
| 44589.020833333336 | 47.44 |
| 44589.03125 | 45.27 |
| 44589.041666666664 | 47.61 |
| 44589.052083333336 | 46.5 |
| 44589.0625 | 50.48 |
| 44589.072916666664 | 48.51 |
| 44589.083333333336 | 47.44 |
| 44589.09375 | 51.57 |
| 44589.104166666664 | 53.01 |
| 44589.114583333336 | 51.07 |
| 44589.125 | 51.48 |
| 44589.135416666664 | 48.26 |
| 44589.145833333336 | 52.71 |
| 44589.15625 | 51.97 |
| 44589.166666666664 | 58.59 |
| 44589.177083333336 | 60.02 |
| 44589.1875 | 51.73 |
| 44589.197916666664 | 48.84 |
| 44589.208333333336 | 46.89 |
| 44589.21875 | 49.26 |
| 44589.229166666664 | 46.19 |
| 44589.239583333336 | 43.61 |
| 44589.25 | 43.54 |
| 44589.260416666664 | 50.47 |
| 44589.270833333336 | 41.88 |
| 44589.28125 | 41.12 |
| 44589.291666666664 | 43.31 |
| 44589.302083333336 | 39.94 |
| 44589.3125 | 42.08 |
| 44589.322916666664 | 41.24 |
| 44589.333333333336 | 38.51 |
| 44589.34375 | 41.81 |
| 44589.354166666664 | 41.45 |
| 44589.364583333336 | 41.81 |
| 44589.375 | 58.36 |
| 44589.385416666664 | 41.98 |
| 44589.395833333336 | 39.75 |
| 44589.40625 | 46.93 |
| 44589.416666666664 | 45.03 |
| 44589.427083333336 | 48.98 |
| 44589.4375 | 44.92 |
| 44589.447916666664 | 39.54 |
| 44589.458333333336 | 42.06 |
| 44589.46875 | 38 |
| 44589.479166666664 | 47.87 |
| 44589.489583333336 | 41.26 |
| 44589.5 | 51.36 |
| 44589.510416666664 | 43.34 |
| 44589.520833333336 | 40.84 |
| 44589.53125 | 40.28 |
| 44589.541666666664 | 40.71 |
| 44589.552083333336 | 38.1 |
| 44589.5625 | 39.65 |
| 44589.572916666664 | 32.77 |
| 44589.583333333336 | 30.58 |
| 44589.59375 | 30.01 |
| 44589.604166666664 | 34.41 |
| 44589.614583333336 | 26.65 |
| 44589.625 | 26.23 |
| 44589.635416666664 | 24.65 |
| 44589.645833333336 | 23.6 |
| 44589.65625 | 23.45 |
| 44589.666666666664 | 28.56 |
| 44589.677083333336 | 36.06 |
| 44589.6875 | 29.64 |
| 44589.697916666664 | 32.59 |
| 44589.708333333336 | 37.06 |
| 44589.71875 | 39.73 |
| 44589.729166666664 | 44.38 |
| 44589.739583333336 | 37.33 |
| 44589.75 | 35 |
| 44589.760416666664 | 33.61 |
| 44589.770833333336 | 35.5 |
| 44589.78125 | 32.36 |
| 44589.791666666664 | 30.86 |
| 44589.802083333336 | 27.44 |
| 44589.8125 | 33.78 |
| 44589.822916666664 | 32.55 |
| 44589.833333333336 | 32.75 |
| 44589.84375 | 33.85 |
| 44589.854166666664 | 37.09 |
| 44589.864583333336 | 38.15 |
| 44589.875 | 39.36 |
| 44589.885416666664 | 39.19 |
| 44589.895833333336 | 39.81 |
| 44589.90625 | 32.82 |
| 44589.916666666664 | 41.95 |
| 44589.927083333336 | 37.91 |
| 44589.9375 | 38.95 |
| 44589.947916666664 | 41.52 |
| 44589.958333333336 | 40.46 |
| 44589.96875 | 40.75 |
| 44589.979166666664 | 41.09 |
| 44589.989583333336 | 40.45 |
| 44590.0 | 39.22 |
| 44590.010416666664 | 41.09 |
| 44590.020833333336 | 41.05 |
| 44590.03125 | 41.24 |
| 44590.041666666664 | 41.75 |
| 44590.052083333336 | 43.46 |
| 44590.0625 | 45.38 |
| 44590.072916666664 | 41.93 |
| 44590.083333333336 | 45.99 |
| 44590.09375 | 48.56 |
| 44590.104166666664 | 49.28 |
| 44590.114583333336 | 49.8 |
| 44590.125 | 49.66 |
| 44590.135416666664 | 52.28 |
| 44590.145833333336 | 52.12 |
| 44590.15625 | 48 |
| 44590.166666666664 | 54.74 |
| 44590.177083333336 | 53.11 |
| 44590.1875 | 53.02 |
| 44590.197916666664 | 62.43 |
| 44590.208333333336 | 56.43 |
| 44590.21875 | 52.16 |
| 44590.229166666664 | 55.28 |
| 44590.239583333336 | 50.93 |
| 44590.25 | 57.64 |
| 44590.260416666664 | 50.18 |
| 44590.270833333336 | 48.85 |
| 44590.28125 | 51.95 |
| 44590.291666666664 | 46.77 |
| 44590.302083333336 | 46.43 |
| 44590.3125 | 44.31 |
| 44590.322916666664 | 43.57 |
| 44590.333333333336 | 45.81 |
| 44590.34375 | 44.96 |
| 44590.354166666664 | 43.85 |
| 44590.364583333336 | 45.16 |
| 44590.375 | 46.92 |
| 44590.385416666664 | 46.56 |
| 44590.395833333336 | 44.99 |
| 44590.40625 | 45.47 |
| 44590.416666666664 | 47.39 |
| 44590.427083333336 | 45.81 |
| 44590.4375 | 46.62 |
| 44590.447916666664 | 49.21 |
| 44590.458333333336 | 50.1 |
| 44590.46875 | 50.13 |
| 44590.479166666664 | 48.82 |
| 44590.489583333336 | 48.82 |
| 44590.5 | 46.24 |
| 44590.510416666664 | 48.38 |
| 44590.520833333336 | 48.74 |
| 44590.53125 | 39.5 |
| 44590.541666666664 | 42.36 |
| 44590.552083333336 | 45.57 |
| 44590.5625 | 38.11 |
| 44590.572916666664 | 42.52 |
| 44590.583333333336 | 47.29 |
| 44590.59375 | 46.41 |
| 44590.604166666664 | 39.93 |
| 44590.614583333336 | 43.11 |
| 44590.625 | 41.44 |
| 44590.635416666664 | 40.65 |
| 44590.645833333336 | 343 |
| 44590.65625 | 42.53 |
| 44590.666666666664 | 40.34 |
| 44590.677083333336 | 36.98 |
| 44590.6875 | 31.41 |
| 44590.697916666664 | 34.69 |
| 44590.708333333336 | 29.24 |
| 44590.71875 | 26.72 |
| 44590.729166666664 | 28.23 |
| 44590.739583333336 | 32.26 |
| 44590.75 | 31.05 |
| 44590.760416666664 | 29.98 |
| 44590.770833333336 | 41.43 |
| 44590.78125 | 43.77 |
| 44590.791666666664 | 40.4 |
| 44590.802083333336 | 32.21 |
| 44590.8125 | 35.24 |
| 44590.822916666664 | 41.59 |
| 44590.833333333336 | 38.49 |
| 44590.84375 | 40.08 |
| 44590.854166666664 | 39.16 |
| 44590.864583333336 | 38.77 |
| 44590.875 | 41.28 |
| 44590.885416666664 | 40.91 |
| 44590.895833333336 | 49.79 |
| 44590.90625 | 47.67 |
| 44590.916666666664 | 49.4 |
| 44590.927083333336 | 52.32 |
| 44590.9375 | 48.69 |
| 44590.947916666664 | 50.28 |
| 44590.958333333336 | 55.91 |
| 44590.96875 | 53 |
| 44590.979166666664 | 53.89 |
| 44590.989583333336 | 58.89 |
| 44591.0 | 51.87 |
| 44591.010416666664 | 69.43 |
| 44591.020833333336 | 51.59 |
| 44591.03125 | 52.72 |
| 44591.041666666664 | 52.99 |
| 44591.052083333336 | 59.95 |
| 44591.0625 | 44.28 |
| 44591.072916666664 | 52.35 |
| 44591.083333333336 | 49.78 |
| 44591.09375 | 48.18 |
| 44591.104166666664 | 51.81 |
| 44591.114583333336 | 57.82 |
| 44591.125 | 70.86 |
| 44591.135416666664 | 54.84 |
| 44591.145833333336 | 62.32 |
| 44591.15625 | 66.22 |
| 44591.166666666664 | 56.97 |
| 44591.177083333336 | 55.84 |
| 44591.1875 | 60.08 |
| 44591.197916666664 | 57.9 |
| 44591.208333333336 | 53.75 |
| 44591.21875 | 72.56 |
| 44591.229166666664 | 58.55 |
| 44591.239583333336 | 60.8 |
| 44591.25 | 58.68 |
| 44591.260416666664 | 62.35 |
| 44591.270833333336 | 60.57 |
| 44591.28125 | 57.41 |
| 44591.291666666664 | 61.43 |
| 44591.302083333336 | 55.78 |
| 44591.3125 | 48.36 |
| 44591.322916666664 | 55.41 |
| 44591.333333333336 | 60.65 |
| 44591.34375 | 56.47 |
| 44591.354166666664 | 57.56 |
| 44591.364583333336 | 59.71 |
| 44591.375 | 59.2 |
| 44591.385416666664 | 52.45 |
| 44591.395833333336 | 64.89 |
| 44591.40625 | 49.79 |
| 44591.416666666664 | 52.68 |
| 44591.427083333336 | 51.39 |
| 44591.4375 | 49.64 |
| 44591.447916666664 | 47.37 |
| 44591.458333333336 | 56.19 |
| 44591.46875 | 58.32 |
| 44591.479166666664 | 62.57 |
| 44591.489583333336 | 54.47 |
| 44591.5 | 64.9 |
| 44591.510416666664 | 49.48 |
| 44591.520833333336 | 61.85 |
| 44591.53125 | 54.4 |
| 44591.541666666664 | 51.31 |
| 44591.552083333336 | 49.95 |
| 44591.5625 | 39.44 |
| 44591.572916666664 | 36.89 |
| 44591.583333333336 | 35.14 |
| 44591.59375 | 30.33 |
| 44591.604166666664 | 29.44 |
| 44591.614583333336 | 25.91 |
| 44591.625 | 26.96 |
| 44591.635416666664 | 28.2 |
| 44591.645833333336 | 30.79 |
| 44591.65625 | 29.02 |
| 44591.666666666664 | 28.95 |
| 44591.677083333336 | 36.42 |
| 44591.6875 | 35.1 |
| 44591.697916666664 | 133.47 |
| 44591.708333333336 | 71.55 |
| 44591.71875 | 26.88 |
| 44591.729166666664 | 28.42 |
| 44591.739583333336 | 26.32 |
| 44591.75 | 26.67 |
| 44591.760416666664 | 25.44 |
| 44591.770833333336 | 26.69 |
| 44591.78125 | 27.01 |
| 44591.791666666664 | 28.9 |
| 44591.802083333336 | 31.01 |
| 44591.8125 | 31.85 |
| 44591.822916666664 | 34.13 |
| 44591.833333333336 | 34.26 |
| 44591.84375 | 38.73 |
| 44591.854166666664 | 38.52 |
| 44591.864583333336 | 34.79 |
| 44591.875 | 37.27 |
| 44591.885416666664 | 40.05 |
| 44591.895833333336 | 39.81 |
| 44591.90625 | 40.08 |
| 44591.916666666664 | 42.72 |
| 44591.927083333336 | 42.63 |
| 44591.9375 | 43.98 |
| 44591.947916666664 | 44.21 |
| 44591.958333333336 | 43.5 |
| 44591.96875 | 43.3 |
| 44591.979166666664 | 42.02 |
| 44591.989583333336 | 49.23 |
| 44592.0 | 45.53 |
| 44592.010416666664 | 47.2 |
| 44592.020833333336 | 39.28 |
| 44592.03125 | 44.18 |
| 44592.041666666664 | 41.98 |
| 44592.052083333336 | 49.68 |
| 44592.0625 | 45.46 |
| 44592.072916666664 | 47.88 |
| 44592.083333333336 | 43.87 |
| 44592.09375 | 45.03 |
| 44592.104166666664 | 46.11 |
| 44592.114583333336 | 43.17 |
| 44592.125 | 51.99 |
| 44592.135416666664 | 51.69 |
| 44592.145833333336 | 48.29 |
| 44592.15625 | 49.57 |
| 44592.166666666664 | 44.86 |
| 44592.177083333336 | 49.6 |
| 44592.1875 | 52.59 |
| 44592.197916666664 | 47.58 |
| 44592.208333333336 | 50.49 |
| 44592.21875 | 48.61 |
| 44592.229166666664 | 48.51 |
| 44592.239583333336 | 63.53 |
| 44592.25 | 57.13 |
| 44592.260416666664 | 58.96 |
| 44592.270833333336 | 49.87 |
| 44592.28125 | 47.8 |
| 44592.291666666664 | 58.43 |
| 44592.302083333336 | 53.41 |
| 44592.3125 | 56.24 |
| 44592.322916666664 | 48.67 |
| 44592.333333333336 | 50 |
| 44592.34375 | 48.5 |
| 44592.354166666664 | 49.78 |
| 44592.364583333336 | 47.92 |
| 44592.375 | 43.31 |
| 44592.385416666664 | 47.56 |
| 44592.395833333336 | 47.18 |
| 44592.40625 | 51.46 |
| 44592.416666666664 | 46.3 |
| 44592.427083333336 | 48.37 |
| 44592.4375 | 47.84 |
| 44592.447916666664 | 46.82 |
| 44592.458333333336 | 48.26 |
| 44592.46875 | 47.29 |
| 44592.479166666664 | 48.46 |
| 44592.489583333336 | 46.24 |
| 44592.5 | 60.12 |
| 44592.510416666664 | 50.01 |
| 44592.520833333336 | 46.68 |
| 44592.53125 | 46.1 |
| 44592.541666666664 | 53.18 |
| 44592.552083333336 | 46.36 |
| 44592.5625 | 36.15 |
| 44592.572916666664 | 33.01 |
| 44592.583333333336 | 33.49 |
| 44592.59375 | 27.49 |
| 44592.604166666664 | 28.32 |
| 44592.614583333336 | 27.74 |
| 44592.625 | 24.96 |
| 44592.635416666664 | 24.15 |
| 44592.645833333336 | 23.71 |
| 44592.65625 | 24.48 |
| 44592.666666666664 | 23.73 |
| 44592.677083333336 | 23.21 |
| 44592.6875 | 24.02 |
| 44592.697916666664 | 24.37 |
| 44592.708333333336 | 24.84 |
| 44592.71875 | 28.4 |
| 44592.729166666664 | 25.86 |
| 44592.739583333336 | 29.84 |
| 44592.75 | 28.26 |
| 44592.760416666664 | 27.46 |
| 44592.770833333336 | 29.04 |
| 44592.78125 | 35.92 |
| 44592.791666666664 | 38.37 |
| 44592.802083333336 | 37.75 |
| 44592.8125 | 42.47 |
| 44592.822916666664 | 40.78 |
| 44592.833333333336 | 37.06 |
| 44592.84375 | 38.77 |
| 44592.854166666664 | 39.48 |
| 44592.864583333336 | 40.96 |
| 44592.875 | 41.91 |
| 44592.885416666664 | 41.09 |
| 44592.895833333336 | 43.51 |
| 44592.90625 | 46.39 |
| 44592.916666666664 | 53.87 |
| 44592.927083333336 | 50.37 |
| 44592.9375 | 47.75 |
| 44592.947916666664 | 50.34 |
| 44592.958333333336 | 54.52 |
| 44592.96875 | 52.89 |
| 44592.979166666664 | 57.02 |
| 44592.989583333336 | 50.72 |
| 44593.0 | 55.89 |
| 44593.010416666664 | 60.18 |
| 44593.020833333336 | 50.89 |
| 44593.03125 | 49.1 |
| 44593.041666666664 | 49.36 |
| 44593.052083333336 | 50.95 |
| 44593.0625 | 58.13 |
| 44593.072916666664 | 55.66 |
| 44593.083333333336 | 52.22 |
| 44593.09375 | 48.64 |
| 44593.104166666664 | 50.44 |
| 44593.114583333336 | 47.93 |
| 44593.125 | 49.5 |
| 44593.135416666664 | 52.43 |
| 44593.145833333336 | 51.7 |
| 44593.15625 | 54.75 |